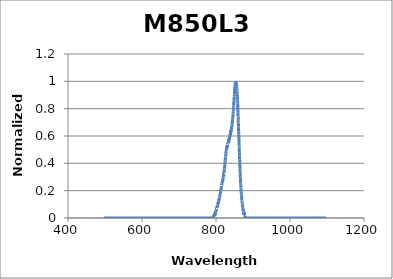
| Category | Normalized Intensity |
|---|---|
| 497.05384596 | 0 |
| 497.20874302 | 0 |
| 497.36364771 | 0 |
| 497.51856002 | 0 |
| 497.67347995 | 0 |
| 497.8284075 | 0 |
| 497.98334267 | 0 |
| 498.13828545 | 0 |
| 498.29323585 | 0 |
| 498.44819386 | 0 |
| 498.60315949 | 0 |
| 498.75813272 | 0 |
| 498.91311355 | 0 |
| 499.06810199 | 0 |
| 499.22309804 | 0 |
| 499.37810169 | 0 |
| 499.53311293 | 0 |
| 499.68813178 | 0 |
| 499.84315822 | 0 |
| 499.99819225 | 0 |
| 500.15323388 | 0 |
| 500.3082831 | 0 |
| 500.4633399 | 0 |
| 500.6184043 | 0 |
| 500.77347627 | 0 |
| 500.92855584 | 0 |
| 501.08364298 | 0 |
| 501.2387377 | 0 |
| 501.39384 | 0 |
| 501.54894988 | 0 |
| 501.70406733 | 0 |
| 501.85919235 | 0 |
| 502.01432494 | 0 |
| 502.1694651 | 0 |
| 502.32461283 | 0 |
| 502.47976813 | 0 |
| 502.63493098 | 0 |
| 502.7901014 | 0 |
| 502.94527938 | 0 |
| 503.10046492 | 0 |
| 503.25565801 | 0 |
| 503.41085865 | 0 |
| 503.56606685 | 0 |
| 503.7212826 | 0 |
| 503.8765059 | 0 |
| 504.03173674 | 0 |
| 504.18697513 | 0 |
| 504.34222106 | 0 |
| 504.49747454 | 0 |
| 504.65273555 | 0 |
| 504.8080041 | 0 |
| 504.96328019 | 0 |
| 505.11856381 | 0 |
| 505.27385496 | 0 |
| 505.42915365 | 0 |
| 505.58445986 | 0 |
| 505.7397736 | 0 |
| 505.89509487 | 0 |
| 506.05042365 | 0 |
| 506.20575996 | 0 |
| 506.36110379 | 0 |
| 506.51645514 | 0 |
| 506.671814 | 0 |
| 506.82718038 | 0 |
| 506.98255426 | 0 |
| 507.13793566 | 0 |
| 507.29332457 | 0 |
| 507.44872099 | 0 |
| 507.60412491 | 0 |
| 507.75953633 | 0 |
| 507.91495525 | 0 |
| 508.07038168 | 0 |
| 508.2258156 | 0 |
| 508.38125702 | 0 |
| 508.53670593 | 0 |
| 508.69216233 | 0 |
| 508.84762623 | 0 |
| 509.00309761 | 0 |
| 509.15857648 | 0 |
| 509.31406283 | 0 |
| 509.46955667 | 0 |
| 509.62505799 | 0 |
| 509.78056679 | 0 |
| 509.93608306 | 0 |
| 510.09160682 | 0 |
| 510.24713804 | 0 |
| 510.40267674 | 0 |
| 510.55822291 | 0 |
| 510.71377655 | 0 |
| 510.86933765 | 0 |
| 511.02490622 | 0 |
| 511.18048225 | 0 |
| 511.33606575 | 0 |
| 511.4916567 | 0 |
| 511.64725511 | 0 |
| 511.80286098 | 0 |
| 511.9584743 | 0 |
| 512.11409507 | 0 |
| 512.2697233 | 0 |
| 512.42535897 | 0 |
| 512.58100209 | 0 |
| 512.73665265 | 0 |
| 512.89231066 | 0 |
| 513.04797611 | 0 |
| 513.20364899 | 0 |
| 513.35932932 | 0 |
| 513.51501708 | 0 |
| 513.67071228 | 0 |
| 513.8264149 | 0 |
| 513.98212496 | 0 |
| 514.13784245 | 0 |
| 514.29356736 | 0 |
| 514.4492997 | 0 |
| 514.60503946 | 0 |
| 514.76078664 | 0 |
| 514.91654125 | 0 |
| 515.07230327 | 0 |
| 515.2280727 | 0 |
| 515.38384955 | 0 |
| 515.53963381 | 0 |
| 515.69542548 | 0 |
| 515.85122456 | 0 |
| 516.00703105 | 0 |
| 516.16284494 | 0 |
| 516.31866624 | 0 |
| 516.47449494 | 0 |
| 516.63033103 | 0 |
| 516.78617453 | 0 |
| 516.94202542 | 0 |
| 517.0978837 | 0 |
| 517.25374938 | 0 |
| 517.40962244 | 0 |
| 517.5655029 | 0 |
| 517.72139074 | 0 |
| 517.87728596 | 0 |
| 518.03318857 | 0 |
| 518.18909856 | 0 |
| 518.34501593 | 0 |
| 518.50094068 | 0 |
| 518.65687281 | 0 |
| 518.8128123 | 0 |
| 518.96875917 | 0 |
| 519.12471341 | 0 |
| 519.28067502 | 0 |
| 519.436644 | 0 |
| 519.59262034 | 0 |
| 519.74860404 | 0 |
| 519.9045951 | 0 |
| 520.06059353 | 0 |
| 520.21659931 | 0 |
| 520.37261245 | 0 |
| 520.52863294 | 0 |
| 520.68466078 | 0 |
| 520.84069597 | 0 |
| 520.99673852 | 0 |
| 521.1527884 | 0 |
| 521.30884564 | 0 |
| 521.46491022 | 0 |
| 521.62098213 | 0 |
| 521.77706139 | 0 |
| 521.93314799 | 0 |
| 522.08924192 | 0 |
| 522.24534318 | 0 |
| 522.40145178 | 0 |
| 522.5575677 | 0 |
| 522.71369096 | 0 |
| 522.86982154 | 0 |
| 523.02595945 | 0 |
| 523.18210468 | 0 |
| 523.33825723 | 0 |
| 523.4944171 | 0 |
| 523.65058429 | 0 |
| 523.80675879 | 0 |
| 523.96294061 | 0 |
| 524.11912974 | 0 |
| 524.27532618 | 0 |
| 524.43152993 | 0 |
| 524.58774098 | 0 |
| 524.74395935 | 0 |
| 524.90018501 | 0 |
| 525.05641797 | 0 |
| 525.21265824 | 0 |
| 525.3689058 | 0 |
| 525.52516065 | 0 |
| 525.68142281 | 0 |
| 525.83769225 | 0 |
| 525.99396898 | 0 |
| 526.150253 | 0 |
| 526.30654431 | 0 |
| 526.46284291 | 0 |
| 526.61914878 | 0 |
| 526.77546194 | 0 |
| 526.93178238 | 0 |
| 527.08811009 | 0 |
| 527.24444508 | 0 |
| 527.40078734 | 0 |
| 527.55713688 | 0 |
| 527.71349369 | 0 |
| 527.86985776 | 0 |
| 528.0262291 | 0 |
| 528.18260771 | 0 |
| 528.33899358 | 0 |
| 528.49538671 | 0 |
| 528.6517871 | 0 |
| 528.80819474 | 0 |
| 528.96460965 | 0 |
| 529.1210318 | 0 |
| 529.27746121 | 0 |
| 529.43389787 | 0 |
| 529.59034178 | 0 |
| 529.74679293 | 0 |
| 529.90325133 | 0 |
| 530.05971697 | 0 |
| 530.21618985 | 0 |
| 530.37266997 | 0 |
| 530.52915733 | 0 |
| 530.68565193 | 0 |
| 530.84215376 | 0 |
| 530.99866282 | 0 |
| 531.15517911 | 0 |
| 531.31170263 | 0 |
| 531.46823338 | 0 |
| 531.62477135 | 0 |
| 531.78131654 | 0 |
| 531.93786896 | 0 |
| 532.09442859 | 0 |
| 532.25099544 | 0 |
| 532.40756951 | 0 |
| 532.56415079 | 0 |
| 532.72073928 | 0 |
| 532.87733499 | 0 |
| 533.0339379 | 0 |
| 533.19054802 | 0 |
| 533.34716534 | 0 |
| 533.50378987 | 0 |
| 533.6604216 | 0 |
| 533.81706052 | 0 |
| 533.97370665 | 0 |
| 534.13035997 | 0 |
| 534.28702048 | 0 |
| 534.44368818 | 0 |
| 534.60036308 | 0 |
| 534.75704516 | 0 |
| 534.91373443 | 0 |
| 535.07043089 | 0 |
| 535.22713453 | 0 |
| 535.38384535 | 0 |
| 535.54056335 | 0 |
| 535.69728852 | 0 |
| 535.85402087 | 0 |
| 536.0107604 | 0 |
| 536.1675071 | 0 |
| 536.32426096 | 0 |
| 536.481022 | 0 |
| 536.6377902 | 0 |
| 536.79456557 | 0 |
| 536.9513481 | 0 |
| 537.10813779 | 0 |
| 537.26493464 | 0 |
| 537.42173865 | 0 |
| 537.57854981 | 0 |
| 537.73536813 | 0 |
| 537.8921936 | 0 |
| 538.04902622 | 0 |
| 538.20586598 | 0 |
| 538.3627129 | 0 |
| 538.51956696 | 0 |
| 538.67642816 | 0 |
| 538.8332965 | 0 |
| 538.99017198 | 0 |
| 539.1470546 | 0 |
| 539.30394436 | 0 |
| 539.46084125 | 0 |
| 539.61774527 | 0 |
| 539.77465642 | 0 |
| 539.9315747 | 0 |
| 540.0885001 | 0 |
| 540.24543263 | 0 |
| 540.40237228 | 0 |
| 540.55931906 | 0 |
| 540.71627295 | 0 |
| 540.87323396 | 0 |
| 541.03020209 | 0 |
| 541.18717733 | 0 |
| 541.34415968 | 0 |
| 541.50114914 | 0 |
| 541.65814571 | 0 |
| 541.81514939 | 0 |
| 541.97216017 | 0 |
| 542.12917805 | 0 |
| 542.28620304 | 0 |
| 542.44323512 | 0 |
| 542.60027431 | 0 |
| 542.75732058 | 0 |
| 542.91437395 | 0 |
| 543.07143442 | 0 |
| 543.22850197 | 0 |
| 543.38557661 | 0 |
| 543.54265834 | 0 |
| 543.69974715 | 0 |
| 543.85684305 | 0 |
| 544.01394602 | 0 |
| 544.17105608 | 0 |
| 544.32817321 | 0 |
| 544.48529742 | 0 |
| 544.6424287 | 0 |
| 544.79956706 | 0 |
| 544.95671248 | 0 |
| 545.11386497 | 0 |
| 545.27102453 | 0 |
| 545.42819116 | 0 |
| 545.58536484 | 0 |
| 545.74254559 | 0 |
| 545.89973339 | 0 |
| 546.05692826 | 0 |
| 546.21413018 | 0 |
| 546.37133915 | 0 |
| 546.52855517 | 0 |
| 546.68577825 | 0 |
| 546.84300837 | 0 |
| 547.00024554 | 0 |
| 547.15748976 | 0 |
| 547.31474101 | 0 |
| 547.47199931 | 0 |
| 547.62926465 | 0 |
| 547.78653702 | 0 |
| 547.94381643 | 0 |
| 548.10110287 | 0 |
| 548.25839635 | 0 |
| 548.41569686 | 0 |
| 548.57300439 | 0 |
| 548.73031895 | 0 |
| 548.88764053 | 0 |
| 549.04496914 | 0 |
| 549.20230477 | 0 |
| 549.35964742 | 0 |
| 549.51699708 | 0 |
| 549.67435376 | 0 |
| 549.83171745 | 0 |
| 549.98908816 | 0 |
| 550.14646588 | 0 |
| 550.3038506 | 0 |
| 550.46124233 | 0 |
| 550.61864106 | 0 |
| 550.7760468 | 0 |
| 550.93345954 | 0 |
| 551.09087928 | 0 |
| 551.24830601 | 0 |
| 551.40573974 | 0 |
| 551.56318047 | 0 |
| 551.72062818 | 0 |
| 551.87808289 | 0 |
| 552.03554458 | 0 |
| 552.19301326 | 0 |
| 552.35048893 | 0 |
| 552.50797158 | 0 |
| 552.6654612 | 0 |
| 552.82295781 | 0 |
| 552.9804614 | 0 |
| 553.13797196 | 0 |
| 553.29548949 | 0 |
| 553.453014 | 0 |
| 553.61054547 | 0 |
| 553.76808392 | 0 |
| 553.92562933 | 0 |
| 554.0831817 | 0 |
| 554.24074104 | 0 |
| 554.39830734 | 0 |
| 554.5558806 | 0 |
| 554.71346081 | 0 |
| 554.87104798 | 0 |
| 555.0286421 | 0 |
| 555.18624318 | 0 |
| 555.3438512 | 0 |
| 555.50146618 | 0 |
| 555.6590881 | 0 |
| 555.81671696 | 0 |
| 555.97435277 | 0 |
| 556.13199552 | 0 |
| 556.28964521 | 0 |
| 556.44730183 | 0 |
| 556.60496539 | 0 |
| 556.76263588 | 0 |
| 556.92031331 | 0 |
| 557.07799766 | 0 |
| 557.23568895 | 0 |
| 557.39338716 | 0 |
| 557.55109229 | 0 |
| 557.70880435 | 0 |
| 557.86652332 | 0 |
| 558.02424922 | 0 |
| 558.18198203 | 0 |
| 558.33972176 | 0 |
| 558.49746841 | 0 |
| 558.65522196 | 0 |
| 558.81298243 | 0 |
| 558.9707498 | 0 |
| 559.12852408 | 0 |
| 559.28630526 | 0 |
| 559.44409335 | 0 |
| 559.60188833 | 0 |
| 559.75969022 | 0 |
| 559.917499 | 0 |
| 560.07531468 | 0 |
| 560.23313725 | 0 |
| 560.39096672 | 0 |
| 560.54880307 | 0 |
| 560.70664631 | 0 |
| 560.86449644 | 0 |
| 561.02235345 | 0 |
| 561.18021735 | 0 |
| 561.33808812 | 0 |
| 561.49596578 | 0 |
| 561.65385031 | 0 |
| 561.81174172 | 0 |
| 561.96964 | 0 |
| 562.12754515 | 0 |
| 562.28545717 | 0 |
| 562.44337606 | 0 |
| 562.60130182 | 0 |
| 562.75923444 | 0 |
| 562.91717393 | 0 |
| 563.07512027 | 0 |
| 563.23307348 | 0 |
| 563.39103354 | 0 |
| 563.54900045 | 0 |
| 563.70697422 | 0 |
| 563.86495484 | 0 |
| 564.02294232 | 0 |
| 564.18093664 | 0 |
| 564.3389378 | 0 |
| 564.49694581 | 0 |
| 564.65496066 | 0 |
| 564.81298236 | 0 |
| 564.97101089 | 0 |
| 565.12904626 | 0 |
| 565.28708846 | 0 |
| 565.4451375 | 0 |
| 565.60319337 | 0 |
| 565.76125607 | 0 |
| 565.9193256 | 0 |
| 566.07740196 | 0 |
| 566.23548513 | 0 |
| 566.39357514 | 0 |
| 566.55167196 | 0 |
| 566.7097756 | 0 |
| 566.86788606 | 0 |
| 567.02600333 | 0 |
| 567.18412742 | 0 |
| 567.34225832 | 0 |
| 567.50039602 | 0 |
| 567.65854054 | 0 |
| 567.81669186 | 0 |
| 567.97484999 | 0 |
| 568.13301492 | 0 |
| 568.29118665 | 0 |
| 568.44936518 | 0 |
| 568.60755051 | 0 |
| 568.76574263 | 0 |
| 568.92394154 | 0 |
| 569.08214725 | 0 |
| 569.24035975 | 0 |
| 569.39857903 | 0 |
| 569.5568051 | 0 |
| 569.71503796 | 0 |
| 569.8732776 | 0 |
| 570.03152401 | 0 |
| 570.18977721 | 0 |
| 570.34803719 | 0 |
| 570.50630394 | 0 |
| 570.66457746 | 0 |
| 570.82285775 | 0 |
| 570.98114482 | 0 |
| 571.13943865 | 0 |
| 571.29773925 | 0 |
| 571.45604661 | 0 |
| 571.61436074 | 0 |
| 571.77268163 | 0 |
| 571.93100927 | 0 |
| 572.08934367 | 0 |
| 572.24768483 | 0 |
| 572.40603274 | 0 |
| 572.56438741 | 0 |
| 572.72274882 | 0 |
| 572.88111698 | 0 |
| 573.03949189 | 0 |
| 573.19787354 | 0 |
| 573.35626193 | 0 |
| 573.51465706 | 0 |
| 573.67305894 | 0 |
| 573.83146755 | 0 |
| 573.98988289 | 0 |
| 574.14830497 | 0 |
| 574.30673378 | 0 |
| 574.46516932 | 0 |
| 574.62361159 | 0 |
| 574.78206058 | 0 |
| 574.9405163 | 0 |
| 575.09897874 | 0 |
| 575.25744791 | 0 |
| 575.41592379 | 0 |
| 575.57440638 | 0 |
| 575.7328957 | 0 |
| 575.89139172 | 0 |
| 576.04989446 | 0 |
| 576.20840391 | 0 |
| 576.36692006 | 0 |
| 576.52544293 | 0 |
| 576.68397249 | 0 |
| 576.84250876 | 0 |
| 577.00105173 | 0 |
| 577.1596014 | 0 |
| 577.31815776 | 0 |
| 577.47672082 | 0 |
| 577.63529058 | 0 |
| 577.79386702 | 0 |
| 577.95245016 | 0 |
| 578.11103998 | 0 |
| 578.26963649 | 0 |
| 578.42823968 | 0 |
| 578.58684956 | 0 |
| 578.74546611 | 0 |
| 578.90408935 | 0 |
| 579.06271926 | 0 |
| 579.22135585 | 0 |
| 579.37999911 | 0 |
| 579.53864904 | 0 |
| 579.69730564 | 0 |
| 579.85596891 | 0 |
| 580.01463885 | 0 |
| 580.17331545 | 0 |
| 580.33199871 | 0 |
| 580.49068864 | 0 |
| 580.64938522 | 0 |
| 580.80808846 | 0 |
| 580.96679835 | 0 |
| 581.1255149 | 0 |
| 581.2842381 | 0 |
| 581.44296795 | 0 |
| 581.60170444 | 0 |
| 581.76044759 | 0 |
| 581.91919737 | 0 |
| 582.0779538 | 0 |
| 582.23671687 | 0 |
| 582.39548658 | 0 |
| 582.55426293 | 0 |
| 582.71304591 | 0 |
| 582.87183552 | 0 |
| 583.03063177 | 0 |
| 583.18943464 | 0 |
| 583.34824415 | 0 |
| 583.50706028 | 0 |
| 583.66588303 | 0 |
| 583.82471241 | 0 |
| 583.9835484 | 0 |
| 584.14239102 | 0 |
| 584.30124025 | 0 |
| 584.4600961 | 0 |
| 584.61895856 | 0 |
| 584.77782763 | 0 |
| 584.93670331 | 0 |
| 585.0955856 | 0 |
| 585.2544745 | 0 |
| 585.41337 | 0 |
| 585.5722721 | 0 |
| 585.7311808 | 0 |
| 585.89009611 | 0 |
| 586.049018 | 0 |
| 586.2079465 | 0 |
| 586.36688159 | 0 |
| 586.52582326 | 0 |
| 586.68477153 | 0 |
| 586.84372639 | 0 |
| 587.00268783 | 0 |
| 587.16165586 | 0 |
| 587.32063047 | 0 |
| 587.47961166 | 0 |
| 587.63859942 | 0 |
| 587.79759377 | 0 |
| 587.95659469 | 0 |
| 588.11560218 | 0 |
| 588.27461625 | 0 |
| 588.43363688 | 0 |
| 588.59266408 | 0 |
| 588.75169785 | 0 |
| 588.91073818 | 0 |
| 589.06978508 | 0 |
| 589.22883853 | 0 |
| 589.38789855 | 0 |
| 589.54696512 | 0 |
| 589.70603824 | 0 |
| 589.86511792 | 0 |
| 590.02420415 | 0 |
| 590.18329693 | 0 |
| 590.34239626 | 0 |
| 590.50150214 | 0 |
| 590.66061455 | 0 |
| 590.81973352 | 0 |
| 590.97885902 | 0 |
| 591.13799106 | 0 |
| 591.29712963 | 0 |
| 591.45627474 | 0 |
| 591.61542639 | 0 |
| 591.77458457 | 0 |
| 591.93374927 | 0 |
| 592.09292051 | 0 |
| 592.25209827 | 0 |
| 592.41128255 | 0 |
| 592.57047336 | 0 |
| 592.72967068 | 0 |
| 592.88887453 | 0 |
| 593.04808489 | 0 |
| 593.20730177 | 0 |
| 593.36652516 | 0 |
| 593.52575506 | 0 |
| 593.68499147 | 0 |
| 593.84423439 | 0 |
| 594.00348382 | 0 |
| 594.16273975 | 0 |
| 594.32200218 | 0 |
| 594.48127111 | 0 |
| 594.64054654 | 0 |
| 594.79982847 | 0 |
| 594.95911689 | 0 |
| 595.11841181 | 0 |
| 595.27771321 | 0 |
| 595.43702111 | 0 |
| 595.59633549 | 0 |
| 595.75565637 | 0 |
| 595.91498372 | 0 |
| 596.07431756 | 0 |
| 596.23365787 | 0 |
| 596.39300467 | 0 |
| 596.55235794 | 0 |
| 596.71171769 | 0 |
| 596.87108391 | 0 |
| 597.0304566 | 0 |
| 597.18983577 | 0 |
| 597.3492214 | 0 |
| 597.50861349 | 0 |
| 597.66801205 | 0 |
| 597.82741707 | 0 |
| 597.98682856 | 0 |
| 598.1462465 | 0 |
| 598.3056709 | 0 |
| 598.46510175 | 0 |
| 598.62453905 | 0 |
| 598.78398281 | 0 |
| 598.94343302 | 0 |
| 599.10288967 | 0 |
| 599.26235277 | 0 |
| 599.42182232 | 0 |
| 599.5812983 | 0 |
| 599.74078073 | 0 |
| 599.9002696 | 0 |
| 600.0597649 | 0 |
| 600.21926664 | 0 |
| 600.37877481 | 0 |
| 600.53828941 | 0 |
| 600.69781044 | 0 |
| 600.8573379 | 0 |
| 601.01687179 | 0 |
| 601.1764121 | 0 |
| 601.33595883 | 0 |
| 601.49551198 | 0 |
| 601.65507155 | 0 |
| 601.81463754 | 0 |
| 601.97420994 | 0 |
| 602.13378876 | 0 |
| 602.29337398 | 0 |
| 602.45296562 | 0 |
| 602.61256366 | 0 |
| 602.77216811 | 0 |
| 602.93177897 | 0 |
| 603.09139622 | 0 |
| 603.25101988 | 0 |
| 603.41064993 | 0 |
| 603.57028639 | 0 |
| 603.72992923 | 0 |
| 603.88957847 | 0 |
| 604.0492341 | 0 |
| 604.20889612 | 0 |
| 604.36856453 | 0 |
| 604.52823933 | 0 |
| 604.6879205 | 0 |
| 604.84760806 | 0 |
| 605.00730201 | 0 |
| 605.16700232 | 0 |
| 605.32670902 | 0 |
| 605.48642209 | 0 |
| 605.64614154 | 0 |
| 605.80586735 | 0 |
| 605.96559954 | 0 |
| 606.12533809 | 0 |
| 606.28508301 | 0 |
| 606.44483429 | 0 |
| 606.60459193 | 0 |
| 606.76435594 | 0 |
| 606.9241263 | 0 |
| 607.08390302 | 0 |
| 607.2436861 | 0 |
| 607.40347552 | 0 |
| 607.5632713 | 0 |
| 607.72307343 | 0 |
| 607.88288191 | 0 |
| 608.04269673 | 0 |
| 608.2025179 | 0 |
| 608.3623454 | 0 |
| 608.52217925 | 0 |
| 608.68201944 | 0 |
| 608.84186596 | 0 |
| 609.00171882 | 0 |
| 609.16157802 | 0 |
| 609.32144354 | 0 |
| 609.48131539 | 0 |
| 609.64119357 | 0 |
| 609.80107808 | 0 |
| 609.96096891 | 0 |
| 610.12086606 | 0 |
| 610.28076953 | 0 |
| 610.44067932 | 0 |
| 610.60059543 | 0 |
| 610.76051785 | 0 |
| 610.92044659 | 0 |
| 611.08038163 | 0 |
| 611.24032299 | 0 |
| 611.40027065 | 0 |
| 611.56022462 | 0 |
| 611.7201849 | 0 |
| 611.88015147 | 0 |
| 612.04012435 | 0 |
| 612.20010352 | 0 |
| 612.36008899 | 0 |
| 612.52008076 | 0 |
| 612.68007882 | 0 |
| 612.84008317 | 0 |
| 613.00009381 | 0 |
| 613.16011074 | 0 |
| 613.32013395 | 0 |
| 613.48016344 | 0 |
| 613.64019922 | 0 |
| 613.80024128 | 0 |
| 613.96028962 | 0 |
| 614.12034423 | 0 |
| 614.28040512 | 0 |
| 614.44047229 | 0 |
| 614.60054572 | 0 |
| 614.76062542 | 0 |
| 614.92071139 | 0 |
| 615.08080363 | 0 |
| 615.24090213 | 0 |
| 615.40100689 | 0 |
| 615.56111791 | 0 |
| 615.72123519 | 0 |
| 615.88135873 | 0 |
| 616.04148852 | 0 |
| 616.20162457 | 0 |
| 616.36176686 | 0 |
| 616.52191541 | 0 |
| 616.6820702 | 0 |
| 616.84223124 | 0 |
| 617.00239853 | 0 |
| 617.16257205 | 0 |
| 617.32275182 | 0 |
| 617.48293782 | 0 |
| 617.64313006 | 0 |
| 617.80332853 | 0 |
| 617.96353324 | 0 |
| 618.12374418 | 0 |
| 618.28396135 | 0 |
| 618.44418475 | 0 |
| 618.60441437 | 0 |
| 618.76465021 | 0 |
| 618.92489228 | 0 |
| 619.08514057 | 0 |
| 619.24539508 | 0 |
| 619.4056558 | 0 |
| 619.56592274 | 0 |
| 619.72619589 | 0 |
| 619.88647525 | 0 |
| 620.04676082 | 0 |
| 620.2070526 | 0 |
| 620.36735058 | 0 |
| 620.52765477 | 0 |
| 620.68796516 | 0 |
| 620.84828175 | 0 |
| 621.00860454 | 0 |
| 621.16893353 | 0 |
| 621.32926871 | 0 |
| 621.48961008 | 0 |
| 621.64995764 | 0 |
| 621.8103114 | 0 |
| 621.97067134 | 0 |
| 622.13103747 | 0 |
| 622.29140978 | 0 |
| 622.45178827 | 0 |
| 622.61217294 | 0 |
| 622.77256379 | 0 |
| 622.93296082 | 0 |
| 623.09336402 | 0 |
| 623.2537734 | 0 |
| 623.41418895 | 0 |
| 623.57461066 | 0 |
| 623.73503854 | 0 |
| 623.89547259 | 0 |
| 624.05591281 | 0 |
| 624.21635918 | 0 |
| 624.37681172 | 0 |
| 624.53727041 | 0 |
| 624.69773526 | 0 |
| 624.85820626 | 0 |
| 625.01868342 | 0 |
| 625.17916673 | 0 |
| 625.33965619 | 0 |
| 625.50015179 | 0 |
| 625.66065354 | 0 |
| 625.82116144 | 0 |
| 625.98167548 | 0 |
| 626.14219565 | 0 |
| 626.30272197 | 0 |
| 626.46325442 | 0 |
| 626.62379301 | 0 |
| 626.78433773 | 0 |
| 626.94488858 | 0 |
| 627.10544556 | 0 |
| 627.26600866 | 0 |
| 627.4265779 | 0 |
| 627.58715325 | 0 |
| 627.74773473 | 0 |
| 627.90832233 | 0 |
| 628.06891605 | 0 |
| 628.22951588 | 0 |
| 628.39012183 | 0 |
| 628.55073389 | 0 |
| 628.71135206 | 0 |
| 628.87197634 | 0 |
| 629.03260673 | 0 |
| 629.19324323 | 0 |
| 629.35388583 | 0 |
| 629.51453453 | 0 |
| 629.67518933 | 0 |
| 629.83585022 | 0 |
| 629.99651722 | 0 |
| 630.15719031 | 0 |
| 630.31786949 | 0 |
| 630.47855477 | 0 |
| 630.63924613 | 0 |
| 630.79994358 | 0 |
| 630.96064711 | 0 |
| 631.12135673 | 0 |
| 631.28207244 | 0 |
| 631.44279422 | 0 |
| 631.60352208 | 0 |
| 631.76425601 | 0 |
| 631.92499603 | 0 |
| 632.08574211 | 0 |
| 632.24649426 | 0 |
| 632.40725249 | 0 |
| 632.56801678 | 0 |
| 632.72878714 | 0 |
| 632.88956356 | 0 |
| 633.05034604 | 0 |
| 633.21113458 | 0 |
| 633.37192918 | 0 |
| 633.53272984 | 0 |
| 633.69353655 | 0 |
| 633.85434932 | 0 |
| 634.01516814 | 0 |
| 634.175993 | 0 |
| 634.33682391 | 0 |
| 634.49766087 | 0 |
| 634.65850387 | 0 |
| 634.81935292 | 0 |
| 634.980208 | 0 |
| 635.14106912 | 0 |
| 635.30193628 | 0 |
| 635.46280948 | 0 |
| 635.6236887 | 0 |
| 635.78457396 | 0 |
| 635.94546524 | 0 |
| 636.10636256 | 0 |
| 636.2672659 | 0 |
| 636.42817526 | 0 |
| 636.58909064 | 0 |
| 636.75001205 | 0 |
| 636.91093947 | 0 |
| 637.07187291 | 0 |
| 637.23281236 | 0 |
| 637.39375783 | 0 |
| 637.55470931 | 0 |
| 637.7156668 | 0 |
| 637.87663029 | 0 |
| 638.03759979 | 0 |
| 638.19857529 | 0 |
| 638.3595568 | 0 |
| 638.5205443 | 0 |
| 638.68153781 | 0 |
| 638.84253731 | 0 |
| 639.0035428 | 0 |
| 639.16455429 | 0 |
| 639.32557177 | 0 |
| 639.48659523 | 0 |
| 639.64762469 | 0 |
| 639.80866013 | 0 |
| 639.96970155 | 0 |
| 640.13074896 | 0 |
| 640.29180234 | 0 |
| 640.45286171 | 0 |
| 640.61392705 | 0 |
| 640.77499836 | 0 |
| 640.93607565 | 0 |
| 641.09715891 | 0 |
| 641.25824814 | 0 |
| 641.41934333 | 0 |
| 641.58044449 | 0 |
| 641.74155162 | 0 |
| 641.9026647 | 0 |
| 642.06378375 | 0 |
| 642.22490875 | 0 |
| 642.38603971 | 0 |
| 642.54717663 | 0 |
| 642.7083195 | 0 |
| 642.86946831 | 0 |
| 643.03062308 | 0 |
| 643.1917838 | 0 |
| 643.35295046 | 0 |
| 643.51412306 | 0 |
| 643.67530161 | 0 |
| 643.83648609 | 0 |
| 643.99767652 | 0 |
| 644.15887288 | 0 |
| 644.32007517 | 0 |
| 644.4812834 | 0 |
| 644.64249756 | 0 |
| 644.80371765 | 0 |
| 644.96494366 | 0 |
| 645.1261756 | 0 |
| 645.28741347 | 0 |
| 645.44865725 | 0 |
| 645.60990696 | 0 |
| 645.77116258 | 0 |
| 645.93242412 | 0 |
| 646.09369158 | 0 |
| 646.25496495 | 0 |
| 646.41624422 | 0 |
| 646.57752941 | 0 |
| 646.73882051 | 0 |
| 646.90011751 | 0 |
| 647.06142041 | 0 |
| 647.22272921 | 0 |
| 647.38404392 | 0 |
| 647.54536452 | 0 |
| 647.70669102 | 0 |
| 647.86802342 | 0 |
| 648.02936171 | 0 |
| 648.19070588 | 0 |
| 648.35205595 | 0 |
| 648.5134119 | 0 |
| 648.67477374 | 0 |
| 648.83614147 | 0 |
| 648.99751507 | 0 |
| 649.15889456 | 0 |
| 649.32027992 | 0 |
| 649.48167116 | 0 |
| 649.64306827 | 0 |
| 649.80447126 | 0 |
| 649.96588012 | 0 |
| 650.12729484 | 0 |
| 650.28871544 | 0 |
| 650.4501419 | 0 |
| 650.61157422 | 0 |
| 650.7730124 | 0 |
| 650.93445645 | 0 |
| 651.09590635 | 0 |
| 651.25736211 | 0 |
| 651.41882372 | 0 |
| 651.58029119 | 0 |
| 651.7417645 | 0 |
| 651.90324367 | 0 |
| 652.06472868 | 0 |
| 652.22621954 | 0 |
| 652.38771624 | 0 |
| 652.54921878 | 0 |
| 652.71072717 | 0 |
| 652.87224139 | 0 |
| 653.03376145 | 0 |
| 653.19528734 | 0 |
| 653.35681906 | 0 |
| 653.51835662 | 0 |
| 653.6799 | 0 |
| 653.84144921 | 0 |
| 654.00300425 | 0 |
| 654.16456511 | 0 |
| 654.32613179 | 0 |
| 654.4877043 | 0 |
| 654.64928262 | 0 |
| 654.81086675 | 0 |
| 654.9724567 | 0 |
| 655.13405247 | 0 |
| 655.29565404 | 0 |
| 655.45726142 | 0 |
| 655.61887461 | 0 |
| 655.78049361 | 0 |
| 655.94211841 | 0 |
| 656.10374901 | 0 |
| 656.26538541 | 0 |
| 656.42702761 | 0 |
| 656.5886756 | 0 |
| 656.75032939 | 0 |
| 656.91198898 | 0 |
| 657.07365435 | 0 |
| 657.23532551 | 0 |
| 657.39700246 | 0 |
| 657.55868519 | 0 |
| 657.72037371 | 0 |
| 657.88206801 | 0 |
| 658.04376809 | 0 |
| 658.20547395 | 0 |
| 658.36718558 | 0 |
| 658.52890299 | 0 |
| 658.69062617 | 0 |
| 658.85235512 | 0 |
| 659.01408984 | 0 |
| 659.17583033 | 0 |
| 659.33757658 | 0 |
| 659.4993286 | 0 |
| 659.66108637 | 0 |
| 659.82284991 | 0 |
| 659.98461921 | 0 |
| 660.14639426 | 0 |
| 660.30817507 | 0 |
| 660.46996162 | 0 |
| 660.63175393 | 0 |
| 660.79355199 | 0 |
| 660.9553558 | 0 |
| 661.11716535 | 0 |
| 661.27898064 | 0 |
| 661.44080168 | 0 |
| 661.60262845 | 0 |
| 661.76446097 | 0 |
| 661.92629922 | 0 |
| 662.0881432 | 0 |
| 662.24999292 | 0 |
| 662.41184837 | 0 |
| 662.57370954 | 0 |
| 662.73557645 | 0 |
| 662.89744907 | 0 |
| 663.05932743 | 0 |
| 663.2212115 | 0 |
| 663.38310129 | 0 |
| 663.5449968 | 0 |
| 663.70689803 | 0 |
| 663.86880497 | 0 |
| 664.03071763 | 0 |
| 664.19263599 | 0 |
| 664.35456007 | 0 |
| 664.51648985 | 0 |
| 664.67842534 | 0 |
| 664.84036653 | 0 |
| 665.00231342 | 0 |
| 665.16426601 | 0 |
| 665.3262243 | 0 |
| 665.48818828 | 0 |
| 665.65015796 | 0 |
| 665.81213334 | 0 |
| 665.9741144 | 0 |
| 666.13610115 | 0 |
| 666.29809359 | 0 |
| 666.46009171 | 0 |
| 666.62209552 | 0 |
| 666.78410501 | 0 |
| 666.94612018 | 0 |
| 667.10814103 | 0 |
| 667.27016755 | 0 |
| 667.43219975 | 0 |
| 667.59423761 | 0 |
| 667.75628116 | 0 |
| 667.91833036 | 0 |
| 668.08038524 | 0 |
| 668.24244578 | 0 |
| 668.40451199 | 0 |
| 668.56658385 | 0 |
| 668.72866138 | 0 |
| 668.89074456 | 0 |
| 669.0528334 | 0 |
| 669.2149279 | 0 |
| 669.37702804 | 0 |
| 669.53913384 | 0 |
| 669.70124529 | 0 |
| 669.86336238 | 0 |
| 670.02548512 | 0 |
| 670.1876135 | 0 |
| 670.34974753 | 0 |
| 670.51188719 | 0 |
| 670.67403249 | 0 |
| 670.83618343 | 0 |
| 670.99834 | 0 |
| 671.1605022 | 0 |
| 671.32267004 | 0 |
| 671.4848435 | 0 |
| 671.64702259 | 0 |
| 671.80920731 | 0 |
| 671.97139765 | 0 |
| 672.13359361 | 0 |
| 672.29579519 | 0 |
| 672.45800239 | 0 |
| 672.6202152 | 0 |
| 672.78243363 | 0 |
| 672.94465767 | 0 |
| 673.10688732 | 0 |
| 673.26912258 | 0 |
| 673.43136345 | 0 |
| 673.59360992 | 0 |
| 673.755862 | 0 |
| 673.91811967 | 0 |
| 674.08038295 | 0 |
| 674.24265183 | 0 |
| 674.4049263 | 0 |
| 674.56720636 | 0 |
| 674.72949202 | 0 |
| 674.89178327 | 0 |
| 675.0540801 | 0 |
| 675.21638253 | 0 |
| 675.37869054 | 0 |
| 675.54100413 | 0 |
| 675.7033233 | 0 |
| 675.86564806 | 0 |
| 676.02797839 | 0 |
| 676.1903143 | 0 |
| 676.35265578 | 0 |
| 676.51500283 | 0 |
| 676.67735546 | 0 |
| 676.83971365 | 0 |
| 677.00207741 | 0 |
| 677.16444674 | 0 |
| 677.32682162 | 0 |
| 677.48920207 | 0 |
| 677.65158808 | 0 |
| 677.81397965 | 0 |
| 677.97637678 | 0 |
| 678.13877945 | 0 |
| 678.30118768 | 0 |
| 678.46360146 | 0 |
| 678.62602079 | 0 |
| 678.78844567 | 0 |
| 678.95087609 | 0 |
| 679.11331206 | 0 |
| 679.27575356 | 0 |
| 679.43820061 | 0 |
| 679.60065319 | 0 |
| 679.76311131 | 0 |
| 679.92557497 | 0 |
| 680.08804415 | 0 |
| 680.25051887 | 0 |
| 680.41299912 | 0 |
| 680.57548489 | 0 |
| 680.73797619 | 0 |
| 680.90047301 | 0 |
| 681.06297535 | 0 |
| 681.22548321 | 0 |
| 681.38799659 | 0 |
| 681.55051549 | 0 |
| 681.7130399 | 0 |
| 681.87556982 | 0 |
| 682.03810525 | 0 |
| 682.2006462 | 0 |
| 682.36319264 | 0 |
| 682.5257446 | 0 |
| 682.68830205 | 0 |
| 682.85086501 | 0 |
| 683.01343347 | 0 |
| 683.17600743 | 0 |
| 683.33858688 | 0 |
| 683.50117182 | 0 |
| 683.66376226 | 0 |
| 683.82635819 | 0 |
| 683.98895961 | 0 |
| 684.15156651 | 0 |
| 684.3141789 | 0 |
| 684.47679677 | 0 |
| 684.63942013 | 0 |
| 684.80204896 | 0 |
| 684.96468327 | 0 |
| 685.12732306 | 0 |
| 685.28996832 | 0 |
| 685.45261905 | 0 |
| 685.61527526 | 0 |
| 685.77793693 | 0 |
| 685.94060407 | 0 |
| 686.10327667 | 0 |
| 686.26595474 | 0 |
| 686.42863827 | 0 |
| 686.59132726 | 0 |
| 686.75402171 | 0 |
| 686.91672161 | 0 |
| 687.07942697 | 0 |
| 687.24213778 | 0 |
| 687.40485403 | 0 |
| 687.56757574 | 0 |
| 687.7303029 | 0 |
| 687.8930355 | 0 |
| 688.05577354 | 0 |
| 688.21851703 | 0 |
| 688.38126595 | 0 |
| 688.54402031 | 0 |
| 688.70678011 | 0 |
| 688.86954534 | 0 |
| 689.032316 | 0 |
| 689.1950921 | 0 |
| 689.35787362 | 0 |
| 689.52066057 | 0 |
| 689.68345295 | 0 |
| 689.84625075 | 0 |
| 690.00905396 | 0 |
| 690.1718626 | 0 |
| 690.33467666 | 0 |
| 690.49749613 | 0 |
| 690.66032102 | 0 |
| 690.82315132 | 0 |
| 690.98598703 | 0 |
| 691.14882815 | 0 |
| 691.31167467 | 0 |
| 691.4745266 | 0 |
| 691.63738393 | 0 |
| 691.80024667 | 0 |
| 691.9631148 | 0 |
| 692.12598833 | 0 |
| 692.28886726 | 0 |
| 692.45175158 | 0 |
| 692.6146413 | 0 |
| 692.7775364 | 0 |
| 692.94043689 | 0 |
| 693.10334277 | 0 |
| 693.26625404 | 0 |
| 693.42917069 | 0 |
| 693.59209271 | 0 |
| 693.75502012 | 0 |
| 693.91795291 | 0 |
| 694.08089107 | 0 |
| 694.24383461 | 0 |
| 694.40678352 | 0 |
| 694.56973779 | 0 |
| 694.73269744 | 0 |
| 694.89566246 | 0 |
| 695.05863284 | 0 |
| 695.22160858 | 0 |
| 695.38458968 | 0 |
| 695.54757614 | 0 |
| 695.71056796 | 0 |
| 695.87356514 | 0 |
| 696.03656767 | 0 |
| 696.19957555 | 0 |
| 696.36258879 | 0 |
| 696.52560737 | 0 |
| 696.6886313 | 0 |
| 696.85166057 | 0 |
| 697.01469519 | 0 |
| 697.17773514 | 0 |
| 697.34078044 | 0 |
| 697.50383108 | 0 |
| 697.66688705 | 0 |
| 697.82994835 | 0 |
| 697.99301499 | 0 |
| 698.15608696 | 0 |
| 698.31916425 | 0 |
| 698.48224687 | 0 |
| 698.64533482 | 0 |
| 698.80842809 | 0 |
| 698.97152668 | 0 |
| 699.1346306 | 0 |
| 699.29773982 | 0 |
| 699.46085437 | 0 |
| 699.62397423 | 0 |
| 699.7870994 | 0 |
| 699.95022988 | 0 |
| 700.11336567 | 0 |
| 700.27650677 | 0 |
| 700.43965317 | 0 |
| 700.60280487 | 0 |
| 700.76596188 | 0 |
| 700.92912418 | 0 |
| 701.09229179 | 0 |
| 701.25546468 | 0 |
| 701.41864288 | 0 |
| 701.58182636 | 0 |
| 701.74501514 | 0 |
| 701.9082092 | 0 |
| 702.07140855 | 0 |
| 702.23461318 | 0 |
| 702.3978231 | 0 |
| 702.5610383 | 0 |
| 702.72425878 | 0 |
| 702.88748454 | 0 |
| 703.05071557 | 0 |
| 703.21395188 | 0 |
| 703.37719345 | 0 |
| 703.5404403 | 0 |
| 703.70369242 | 0 |
| 703.8669498 | 0 |
| 704.03021245 | 0 |
| 704.19348036 | 0 |
| 704.35675354 | 0 |
| 704.52003197 | 0 |
| 704.68331566 | 0 |
| 704.8466046 | 0 |
| 705.0098988 | 0 |
| 705.17319825 | 0 |
| 705.33650296 | 0 |
| 705.49981291 | 0 |
| 705.6631281 | 0 |
| 705.82644855 | 0 |
| 705.98977423 | 0 |
| 706.15310516 | 0 |
| 706.31644132 | 0 |
| 706.47978273 | 0 |
| 706.64312936 | 0 |
| 706.80648124 | 0 |
| 706.96983834 | 0 |
| 707.13320068 | 0 |
| 707.29656824 | 0 |
| 707.45994103 | 0 |
| 707.62331905 | 0 |
| 707.78670228 | 0 |
| 707.95009074 | 0 |
| 708.11348442 | 0 |
| 708.27688332 | 0 |
| 708.44028743 | 0 |
| 708.60369676 | 0 |
| 708.76711129 | 0 |
| 708.93053104 | 0 |
| 709.093956 | 0 |
| 709.25738616 | 0 |
| 709.42082153 | 0 |
| 709.5842621 | 0 |
| 709.74770787 | 0 |
| 709.91115884 | 0 |
| 710.07461501 | 0 |
| 710.23807638 | 0 |
| 710.40154294 | 0 |
| 710.56501469 | 0 |
| 710.72849163 | 0 |
| 710.89197376 | 0 |
| 711.05546107 | 0 |
| 711.21895357 | 0 |
| 711.38245126 | 0 |
| 711.54595412 | 0 |
| 711.70946217 | 0 |
| 711.87297539 | 0 |
| 712.03649379 | 0 |
| 712.20001736 | 0 |
| 712.3635461 | 0 |
| 712.52708001 | 0 |
| 712.6906191 | 0 |
| 712.85416335 | 0 |
| 713.01771276 | 0 |
| 713.18126733 | 0 |
| 713.34482707 | 0 |
| 713.50839197 | 0 |
| 713.67196202 | 0 |
| 713.83553723 | 0 |
| 713.9991176 | 0 |
| 714.16270311 | 0 |
| 714.32629378 | 0 |
| 714.48988959 | 0 |
| 714.65349055 | 0 |
| 714.81709666 | 0 |
| 714.98070791 | 0 |
| 715.1443243 | 0 |
| 715.30794583 | 0 |
| 715.47157249 | 0 |
| 715.6352043 | 0 |
| 715.79884123 | 0 |
| 715.9624833 | 0 |
| 716.1261305 | 0 |
| 716.28978282 | 0 |
| 716.45344028 | 0 |
| 716.61710286 | 0 |
| 716.78077056 | 0 |
| 716.94444338 | 0 |
| 717.10812132 | 0 |
| 717.27180438 | 0 |
| 717.43549255 | 0 |
| 717.59918584 | 0 |
| 717.76288424 | 0 |
| 717.92658775 | 0 |
| 718.09029637 | 0 |
| 718.25401009 | 0 |
| 718.41772892 | 0 |
| 718.58145286 | 0 |
| 718.74518189 | 0 |
| 718.90891602 | 0 |
| 719.07265525 | 0 |
| 719.23639958 | 0 |
| 719.400149 | 0 |
| 719.56390351 | 0 |
| 719.72766311 | 0 |
| 719.8914278 | 0 |
| 720.05519758 | 0 |
| 720.21897244 | 0 |
| 720.38275239 | 0 |
| 720.54653741 | 0 |
| 720.71032752 | 0 |
| 720.8741227 | 0 |
| 721.03792296 | 0 |
| 721.20172829 | 0 |
| 721.36553869 | 0 |
| 721.52935417 | 0 |
| 721.69317471 | 0 |
| 721.85700032 | 0 |
| 722.02083099 | 0 |
| 722.18466673 | 0 |
| 722.34850752 | 0 |
| 722.51235338 | 0 |
| 722.67620429 | 0 |
| 722.84006026 | 0 |
| 723.00392129 | 0 |
| 723.16778736 | 0 |
| 723.33165849 | 0 |
| 723.49553466 | 0 |
| 723.65941588 | 0 |
| 723.82330215 | 0 |
| 723.98719345 | 0 |
| 724.1510898 | 0 |
| 724.31499119 | 0 |
| 724.47889761 | 0 |
| 724.64280907 | 0 |
| 724.80672557 | 0 |
| 724.9706471 | 0 |
| 725.13457365 | 0 |
| 725.29850524 | 0 |
| 725.46244185 | 0 |
| 725.62638348 | 0 |
| 725.79033014 | 0 |
| 725.95428182 | 0 |
| 726.11823852 | 0 |
| 726.28220024 | 0 |
| 726.44616697 | 0 |
| 726.61013871 | 0 |
| 726.77411547 | 0 |
| 726.93809724 | 0 |
| 727.10208402 | 0 |
| 727.2660758 | 0 |
| 727.43007258 | 0 |
| 727.59407437 | 0 |
| 727.75808116 | 0 |
| 727.92209295 | 0 |
| 728.08610974 | 0 |
| 728.25013152 | 0 |
| 728.4141583 | 0 |
| 728.57819007 | 0 |
| 728.74222683 | 0 |
| 728.90626857 | 0 |
| 729.07031531 | 0 |
| 729.23436703 | 0 |
| 729.39842373 | 0 |
| 729.56248541 | 0 |
| 729.72655207 | 0 |
| 729.89062371 | 0 |
| 730.05470032 | 0 |
| 730.21878191 | 0 |
| 730.38286847 | 0 |
| 730.54695999 | 0 |
| 730.71105649 | 0 |
| 730.87515796 | 0 |
| 731.03926438 | 0 |
| 731.20337577 | 0 |
| 731.36749213 | 0 |
| 731.53161344 | 0 |
| 731.69573971 | 0 |
| 731.85987093 | 0 |
| 732.02400711 | 0 |
| 732.18814824 | 0 |
| 732.35229432 | 0 |
| 732.51644535 | 0 |
| 732.68060132 | 0 |
| 732.84476224 | 0 |
| 733.0089281 | 0 |
| 733.1730989 | 0 |
| 733.33727464 | 0 |
| 733.50145532 | 0 |
| 733.66564094 | 0 |
| 733.82983148 | 0 |
| 733.99402696 | 0 |
| 734.15822737 | 0 |
| 734.32243271 | 0 |
| 734.48664298 | 0 |
| 734.65085817 | 0 |
| 734.81507828 | 0 |
| 734.97930331 | 0 |
| 735.14353326 | 0 |
| 735.30776813 | 0 |
| 735.47200792 | 0 |
| 735.63625261 | 0 |
| 735.80050222 | 0 |
| 735.96475674 | 0 |
| 736.12901617 | 0 |
| 736.29328051 | 0 |
| 736.45754975 | 0 |
| 736.62182389 | 0 |
| 736.78610293 | 0 |
| 736.95038687 | 0 |
| 737.11467571 | 0 |
| 737.27896945 | 0 |
| 737.44326807 | 0 |
| 737.60757159 | 0 |
| 737.77188 | 0 |
| 737.9361933 | 0 |
| 738.10051149 | 0 |
| 738.26483455 | 0 |
| 738.42916251 | 0 |
| 738.59349534 | 0 |
| 738.75783305 | 0 |
| 738.92217564 | 0 |
| 739.0865231 | 0 |
| 739.25087544 | 0 |
| 739.41523265 | 0 |
| 739.57959473 | 0 |
| 739.74396168 | 0 |
| 739.90833349 | 0 |
| 740.07271017 | 0 |
| 740.23709171 | 0 |
| 740.40147811 | 0 |
| 740.56586938 | 0 |
| 740.73026549 | 0 |
| 740.89466647 | 0 |
| 741.0590723 | 0 |
| 741.22348297 | 0 |
| 741.3878985 | 0 |
| 741.55231888 | 0 |
| 741.7167441 | 0 |
| 741.88117417 | 0 |
| 742.04560908 | 0 |
| 742.21004884 | 0 |
| 742.37449343 | 0 |
| 742.53894285 | 0 |
| 742.70339712 | 0 |
| 742.86785621 | 0 |
| 743.03232014 | 0 |
| 743.1967889 | 0 |
| 743.36126249 | 0 |
| 743.5257409 | 0 |
| 743.69022414 | 0 |
| 743.8547122 | 0 |
| 744.01920508 | 0 |
| 744.18370278 | 0 |
| 744.3482053 | 0 |
| 744.51271263 | 0 |
| 744.67722477 | 0 |
| 744.84174173 | 0 |
| 745.0062635 | 0 |
| 745.17079007 | 0 |
| 745.33532146 | 0 |
| 745.49985764 | 0 |
| 745.66439863 | 0 |
| 745.82894442 | 0 |
| 745.99349501 | 0 |
| 746.1580504 | 0 |
| 746.32261058 | 0 |
| 746.48717555 | 0 |
| 746.65174532 | 0 |
| 746.81631988 | 0 |
| 746.98089922 | 0 |
| 747.14548335 | 0 |
| 747.31007227 | 0 |
| 747.47466597 | 0 |
| 747.63926444 | 0 |
| 747.8038677 | 0 |
| 747.96847574 | 0 |
| 748.13308855 | 0 |
| 748.29770613 | 0 |
| 748.46232849 | 0 |
| 748.62695561 | 0 |
| 748.7915875 | 0 |
| 748.95622416 | 0 |
| 749.12086559 | 0 |
| 749.28551177 | 0 |
| 749.45016272 | 0 |
| 749.61481843 | 0 |
| 749.77947889 | 0 |
| 749.94414411 | 0 |
| 750.10881408 | 0 |
| 750.27348881 | 0 |
| 750.43816828 | 0 |
| 750.6028525 | 0 |
| 750.76754147 | 0 |
| 750.93223518 | 0 |
| 751.09693364 | 0 |
| 751.26163683 | 0 |
| 751.42634477 | 0 |
| 751.59105744 | 0 |
| 751.75577485 | 0 |
| 751.92049699 | 0 |
| 752.08522386 | 0 |
| 752.24995546 | 0 |
| 752.41469179 | 0 |
| 752.57943285 | 0 |
| 752.74417863 | 0 |
| 752.90892914 | 0 |
| 753.07368436 | 0 |
| 753.2384443 | 0 |
| 753.40320896 | 0 |
| 753.56797834 | 0 |
| 753.73275243 | 0 |
| 753.89753123 | 0 |
| 754.06231474 | 0 |
| 754.22710296 | 0 |
| 754.39189588 | 0 |
| 754.55669351 | 0 |
| 754.72149584 | 0 |
| 754.88630287 | 0 |
| 755.05111461 | 0 |
| 755.21593103 | 0 |
| 755.38075216 | 0 |
| 755.54557797 | 0 |
| 755.71040848 | 0 |
| 755.87524368 | 0 |
| 756.04008357 | 0 |
| 756.20492814 | 0 |
| 756.3697774 | 0 |
| 756.53463134 | 0 |
| 756.69948996 | 0 |
| 756.86435326 | 0 |
| 757.02922123 | 0 |
| 757.19409388 | 0 |
| 757.35897121 | 0 |
| 757.5238532 | 0 |
| 757.68873987 | 0 |
| 757.8536312 | 0 |
| 758.01852721 | 0 |
| 758.18342787 | 0 |
| 758.3483332 | 0 |
| 758.51324318 | 0 |
| 758.67815783 | 0 |
| 758.84307714 | 0 |
| 759.00800109 | 0 |
| 759.17292971 | 0 |
| 759.33786297 | 0 |
| 759.50280088 | 0 |
| 759.66774345 | 0 |
| 759.83269065 | 0 |
| 759.99764251 | 0 |
| 760.162599 | 0 |
| 760.32756014 | 0 |
| 760.49252591 | 0 |
| 760.65749632 | 0 |
| 760.82247137 | 0 |
| 760.98745105 | 0 |
| 761.15243536 | 0 |
| 761.3174243 | 0 |
| 761.48241787 | 0 |
| 761.64741607 | 0 |
| 761.81241889 | 0 |
| 761.97742633 | 0 |
| 762.14243839 | 0 |
| 762.30745507 | 0 |
| 762.47247637 | 0 |
| 762.63750228 | 0 |
| 762.80253281 | 0 |
| 762.96756795 | 0 |
| 763.1326077 | 0 |
| 763.29765205 | 0 |
| 763.46270102 | 0 |
| 763.62775458 | 0 |
| 763.79281275 | 0 |
| 763.95787552 | 0 |
| 764.12294289 | 0 |
| 764.28801486 | 0 |
| 764.45309142 | 0 |
| 764.61817257 | 0 |
| 764.78325832 | 0 |
| 764.94834865 | 0 |
| 765.11344358 | 0 |
| 765.27854309 | 0 |
| 765.44364718 | 0 |
| 765.60875586 | 0 |
| 765.77386911 | 0 |
| 765.93898695 | 0 |
| 766.10410936 | 0 |
| 766.26923635 | 0 |
| 766.43436791 | 0 |
| 766.59950404 | 0 |
| 766.76464474 | 0 |
| 766.92979001 | 0 |
| 767.09493985 | 0 |
| 767.26009425 | 0 |
| 767.42525321 | 0 |
| 767.59041674 | 0 |
| 767.75558482 | 0 |
| 767.92075746 | 0 |
| 768.08593465 | 0 |
| 768.2511164 | 0 |
| 768.4163027 | 0 |
| 768.58149355 | 0 |
| 768.74668895 | 0 |
| 768.91188889 | 0 |
| 769.07709338 | 0 |
| 769.2423024 | 0 |
| 769.40751597 | 0 |
| 769.57273408 | 0 |
| 769.73795673 | 0 |
| 769.90318391 | 0 |
| 770.06841562 | 0 |
| 770.23365187 | 0 |
| 770.39889265 | 0 |
| 770.56413795 | 0 |
| 770.72938778 | 0 |
| 770.89464213 | 0 |
| 771.05990101 | 0 |
| 771.2251644 | 0 |
| 771.39043232 | 0 |
| 771.55570475 | 0 |
| 771.7209817 | 0 |
| 771.88626316 | 0 |
| 772.05154913 | 0 |
| 772.21683961 | 0 |
| 772.3821346 | 0 |
| 772.5474341 | 0 |
| 772.7127381 | 0 |
| 772.8780466 | 0 |
| 773.0433596 | 0 |
| 773.2086771 | 0 |
| 773.3739991 | 0 |
| 773.53932559 | 0 |
| 773.70465658 | 0 |
| 773.86999206 | 0 |
| 774.03533203 | 0 |
| 774.20067648 | 0 |
| 774.36602542 | 0 |
| 774.53137885 | 0 |
| 774.69673676 | 0 |
| 774.86209915 | 0 |
| 775.02746601 | 0 |
| 775.19283736 | 0 |
| 775.35821318 | 0 |
| 775.52359347 | 0 |
| 775.68897823 | 0 |
| 775.85436747 | 0 |
| 776.01976117 | 0 |
| 776.18515933 | 0 |
| 776.35056197 | 0 |
| 776.51596906 | 0 |
| 776.68138061 | 0 |
| 776.84679663 | 0 |
| 777.0122171 | 0 |
| 777.17764202 | 0 |
| 777.3430714 | 0 |
| 777.50850523 | 0 |
| 777.67394351 | 0 |
| 777.83938624 | 0 |
| 778.00483341 | 0 |
| 778.17028503 | 0 |
| 778.33574108 | 0 |
| 778.50120158 | 0 |
| 778.66666652 | 0 |
| 778.8321359 | 0 |
| 778.99760971 | 0 |
| 779.16308795 | 0 |
| 779.32857063 | 0 |
| 779.49405773 | 0 |
| 779.65954926 | 0 |
| 779.82504522 | 0 |
| 779.99054561 | 0 |
| 780.15605041 | 0 |
| 780.32155964 | 0 |
| 780.48707328 | 0 |
| 780.65259134 | 0 |
| 780.81811382 | 0 |
| 780.9836407 | 0 |
| 781.14917201 | 0 |
| 781.31470772 | 0 |
| 781.48024783 | 0 |
| 781.64579236 | 0 |
| 781.81134128 | 0 |
| 781.97689461 | 0 |
| 782.14245234 | 0 |
| 782.30801447 | 0 |
| 782.473581 | 0 |
| 782.63915192 | 0 |
| 782.80472723 | 0 |
| 782.97030694 | 0 |
| 783.13589104 | 0 |
| 783.30147952 | 0 |
| 783.46707239 | 0 |
| 783.63266964 | 0 |
| 783.79827127 | 0 |
| 783.96387729 | 0 |
| 784.12948768 | 0 |
| 784.29510245 | 0 |
| 784.4607216 | 0 |
| 784.62634512 | 0 |
| 784.79197301 | 0 |
| 784.95760527 | 0 |
| 785.1232419 | 0 |
| 785.28888289 | 0 |
| 785.45452825 | 0 |
| 785.62017797 | 0 |
| 785.78583205 | 0 |
| 785.95149049 | 0 |
| 786.11715328 | 0 |
| 786.28282043 | 0 |
| 786.44849194 | 0 |
| 786.61416779 | 0 |
| 786.779848 | 0 |
| 786.94553255 | 0 |
| 787.11122145 | 0 |
| 787.27691469 | 0 |
| 787.44261228 | 0 |
| 787.6083142 | 0 |
| 787.77402046 | 0 |
| 787.93973106 | 0 |
| 788.105446 | 0 |
| 788.27116527 | 0 |
| 788.43688887 | 0 |
| 788.6026168 | 0 |
| 788.76834905 | 0 |
| 788.93408564 | 0 |
| 789.09982654 | 0 |
| 789.26557177 | 0 |
| 789.43132132 | 0 |
| 789.59707519 | 0 |
| 789.76283337 | 0 |
| 789.92859587 | 0 |
| 790.09436269 | 0 |
| 790.26013381 | 0 |
| 790.42590924 | 0 |
| 790.59168898 | 0 |
| 790.75747303 | 0 |
| 790.92326138 | 0 |
| 791.08905403 | 0.002 |
| 791.25485099 | 0 |
| 791.42065224 | 0.005 |
| 791.58645779 | 0.001 |
| 791.75226763 | 0.006 |
| 791.91808177 | 0.005 |
| 792.0839002 | 0.01 |
| 792.24972292 | 0.005 |
| 792.41554992 | 0.007 |
| 792.58138121 | 0.008 |
| 792.74721679 | 0.011 |
| 792.91305664 | 0.009 |
| 793.07890078 | 0.011 |
| 793.2447492 | 0.013 |
| 793.41060189 | 0.012 |
| 793.57645886 | 0.013 |
| 793.7423201 | 0.016 |
| 793.90818561 | 0.012 |
| 794.07405539 | 0.018 |
| 794.23992944 | 0.017 |
| 794.40580776 | 0.02 |
| 794.57169034 | 0.017 |
| 794.73757718 | 0.022 |
| 794.90346828 | 0.023 |
| 795.06936364 | 0.023 |
| 795.23526326 | 0.025 |
| 795.40116713 | 0.022 |
| 795.56707525 | 0.026 |
| 795.73298763 | 0.026 |
| 795.89890425 | 0.026 |
| 796.06482513 | 0.023 |
| 796.23075024 | 0.027 |
| 796.39667961 | 0.028 |
| 796.56261321 | 0.023 |
| 796.72855106 | 0.03 |
| 796.89449314 | 0.026 |
| 797.06043946 | 0.03 |
| 797.22639002 | 0.025 |
| 797.3923448 | 0.026 |
| 797.55830382 | 0.023 |
| 797.72426707 | 0.025 |
| 797.89023455 | 0.027 |
| 798.05620625 | 0.04 |
| 798.22218218 | 0.03 |
| 798.38816232 | 0.039 |
| 798.55414669 | 0.033 |
| 798.72013528 | 0.034 |
| 798.88612808 | 0.034 |
| 799.0521251 | 0.046 |
| 799.21812633 | 0.047 |
| 799.38413178 | 0.054 |
| 799.55014143 | 0.054 |
| 799.71615529 | 0.051 |
| 799.88217335 | 0.051 |
| 800.04819562 | 0.052 |
| 800.2142221 | 0.049 |
| 800.38025277 | 0.056 |
| 800.54628764 | 0.05 |
| 800.7123267 | 0.055 |
| 800.87836997 | 0.056 |
| 801.04441742 | 0.061 |
| 801.21046907 | 0.06 |
| 801.3765249 | 0.063 |
| 801.54258492 | 0.068 |
| 801.70864913 | 0.071 |
| 801.87471753 | 0.071 |
| 802.0407901 | 0.073 |
| 802.20686686 | 0.074 |
| 802.37294779 | 0.075 |
| 802.5390329 | 0.075 |
| 802.70512218 | 0.081 |
| 802.87121564 | 0.079 |
| 803.03731327 | 0.082 |
| 803.20341507 | 0.083 |
| 803.36952103 | 0.087 |
| 803.53563117 | 0.083 |
| 803.70174546 | 0.091 |
| 803.86786392 | 0.088 |
| 804.03398654 | 0.093 |
| 804.20011331 | 0.094 |
| 804.36624425 | 0.095 |
| 804.53237933 | 0.096 |
| 804.69851857 | 0.101 |
| 804.86466197 | 0.1 |
| 805.03080951 | 0.102 |
| 805.1969612 | 0.102 |
| 805.36311703 | 0.108 |
| 805.52927701 | 0.106 |
| 805.69544113 | 0.111 |
| 805.86160939 | 0.105 |
| 806.02778179 | 0.113 |
| 806.19395832 | 0.11 |
| 806.36013899 | 0.115 |
| 806.5263238 | 0.115 |
| 806.69251273 | 0.118 |
| 806.85870579 | 0.12 |
| 807.02490299 | 0.123 |
| 807.1911043 | 0.121 |
| 807.35730974 | 0.125 |
| 807.52351931 | 0.123 |
| 807.68973299 | 0.13 |
| 807.85595079 | 0.132 |
| 808.02217271 | 0.135 |
| 808.18839874 | 0.131 |
| 808.35462889 | 0.138 |
| 808.52086314 | 0.137 |
| 808.68710151 | 0.141 |
| 808.85334398 | 0.141 |
| 809.01959056 | 0.144 |
| 809.18584124 | 0.141 |
| 809.35209603 | 0.15 |
| 809.51835491 | 0.151 |
| 809.6846179 | 0.155 |
| 809.85088498 | 0.152 |
| 810.01715615 | 0.157 |
| 810.18343142 | 0.161 |
| 810.34971078 | 0.163 |
| 810.51599423 | 0.164 |
| 810.68228176 | 0.17 |
| 810.84857339 | 0.165 |
| 811.01486909 | 0.171 |
| 811.18116888 | 0.175 |
| 811.34747275 | 0.176 |
| 811.51378069 | 0.175 |
| 811.68009271 | 0.18 |
| 811.84640881 | 0.183 |
| 812.01272898 | 0.191 |
| 812.17905322 | 0.189 |
| 812.34538153 | 0.193 |
| 812.51171391 | 0.196 |
| 812.67805035 | 0.198 |
| 812.84439086 | 0.196 |
| 813.01073543 | 0.203 |
| 813.17708406 | 0.202 |
| 813.34343675 | 0.209 |
| 813.50979349 | 0.208 |
| 813.67615429 | 0.213 |
| 813.84251914 | 0.217 |
| 814.00888804 | 0.222 |
| 814.175261 | 0.223 |
| 814.34163799 | 0.227 |
| 814.50801904 | 0.228 |
| 814.67440413 | 0.233 |
| 814.84079326 | 0.232 |
| 815.00718643 | 0.231 |
| 815.17358364 | 0.234 |
| 815.33998489 | 0.238 |
| 815.50639017 | 0.242 |
| 815.67279948 | 0.25 |
| 815.83921282 | 0.247 |
| 816.0056302 | 0.253 |
| 816.1720516 | 0.253 |
| 816.33847703 | 0.254 |
| 816.50490648 | 0.253 |
| 816.67133995 | 0.257 |
| 816.83777744 | 0.257 |
| 817.00421895 | 0.265 |
| 817.17066448 | 0.263 |
| 817.33711402 | 0.262 |
| 817.50356758 | 0.27 |
| 817.67002514 | 0.275 |
| 817.83648672 | 0.273 |
| 818.0029523 | 0.274 |
| 818.16942189 | 0.278 |
| 818.33589548 | 0.28 |
| 818.50237307 | 0.283 |
| 818.66885467 | 0.287 |
| 818.83534026 | 0.281 |
| 819.00182985 | 0.289 |
| 819.16832343 | 0.291 |
| 819.33482101 | 0.294 |
| 819.50132257 | 0.294 |
| 819.66782813 | 0.297 |
| 819.83433767 | 0.299 |
| 820.0008512 | 0.306 |
| 820.16736872 | 0.306 |
| 820.33389021 | 0.314 |
| 820.50041569 | 0.305 |
| 820.66694514 | 0.318 |
| 820.83347857 | 0.312 |
| 821.00001597 | 0.319 |
| 821.16655735 | 0.323 |
| 821.3331027 | 0.327 |
| 821.49965202 | 0.327 |
| 821.6662053 | 0.334 |
| 821.83276255 | 0.337 |
| 821.99932377 | 0.344 |
| 822.16588894 | 0.339 |
| 822.33245808 | 0.349 |
| 822.49903117 | 0.359 |
| 822.66560822 | 0.363 |
| 822.83218923 | 0.367 |
| 822.99877419 | 0.372 |
| 823.16536309 | 0.372 |
| 823.33195595 | 0.375 |
| 823.49855276 | 0.38 |
| 823.66515351 | 0.386 |
| 823.8317582 | 0.393 |
| 823.99836684 | 0.395 |
| 824.16497942 | 0.399 |
| 824.33159593 | 0.405 |
| 824.49821638 | 0.412 |
| 824.66484077 | 0.412 |
| 824.83146909 | 0.418 |
| 824.99810134 | 0.423 |
| 825.16473752 | 0.434 |
| 825.33137762 | 0.429 |
| 825.49802166 | 0.44 |
| 825.66466961 | 0.441 |
| 825.83132149 | 0.449 |
| 825.99797729 | 0.45 |
| 826.164637 | 0.455 |
| 826.33130063 | 0.462 |
| 826.49796818 | 0.465 |
| 826.66463964 | 0.468 |
| 826.83131501 | 0.472 |
| 826.99799429 | 0.485 |
| 827.16467747 | 0.479 |
| 827.33136457 | 0.483 |
| 827.49805556 | 0.487 |
| 827.66475046 | 0.487 |
| 827.83144926 | 0.493 |
| 827.99815195 | 0.498 |
| 828.16485855 | 0.502 |
| 828.33156903 | 0.5 |
| 828.49828341 | 0.505 |
| 828.66500168 | 0.508 |
| 828.83172384 | 0.516 |
| 828.99844989 | 0.51 |
| 829.16517982 | 0.518 |
| 829.33191364 | 0.523 |
| 829.49865134 | 0.525 |
| 829.66539291 | 0.518 |
| 829.83213837 | 0.527 |
| 829.9988877 | 0.521 |
| 830.16564091 | 0.53 |
| 830.33239799 | 0.526 |
| 830.49915894 | 0.524 |
| 830.66592376 | 0.532 |
| 830.83269245 | 0.531 |
| 830.999465 | 0.53 |
| 831.16624141 | 0.532 |
| 831.33302169 | 0.53 |
| 831.49980583 | 0.534 |
| 831.66659383 | 0.536 |
| 831.83338568 | 0.538 |
| 832.00018139 | 0.538 |
| 832.16698094 | 0.539 |
| 832.33378436 | 0.543 |
| 832.50059161 | 0.546 |
| 832.66740272 | 0.546 |
| 832.83421767 | 0.555 |
| 833.00103647 | 0.553 |
| 833.16785911 | 0.552 |
| 833.33468559 | 0.548 |
| 833.5015159 | 0.553 |
| 833.66835005 | 0.555 |
| 833.83518804 | 0.558 |
| 834.00202986 | 0.557 |
| 834.16887551 | 0.565 |
| 834.33572499 | 0.555 |
| 834.50257829 | 0.569 |
| 834.66943543 | 0.567 |
| 834.83629638 | 0.57 |
| 835.00316116 | 0.573 |
| 835.17002976 | 0.572 |
| 835.33690217 | 0.568 |
| 835.5037784 | 0.581 |
| 835.67065845 | 0.574 |
| 835.83754231 | 0.577 |
| 836.00442998 | 0.576 |
| 836.17132146 | 0.586 |
| 836.33821674 | 0.583 |
| 836.50511583 | 0.591 |
| 836.67201873 | 0.585 |
| 836.83892543 | 0.588 |
| 837.00583592 | 0.593 |
| 837.17275022 | 0.595 |
| 837.33966831 | 0.596 |
| 837.50659019 | 0.599 |
| 837.67351587 | 0.598 |
| 837.84044534 | 0.604 |
| 838.0073786 | 0.603 |
| 838.17431564 | 0.609 |
| 838.34125648 | 0.606 |
| 838.5082010900001 | 0.614 |
| 838.67514949 | 0.608 |
| 838.84210166 | 0.615 |
| 839.00905762 | 0.614 |
| 839.17601735 | 0.627 |
| 839.34298085 | 0.622 |
| 839.50994813 | 0.627 |
| 839.67691918 | 0.624 |
| 839.84389399 | 0.629 |
| 840.01087258 | 0.632 |
| 840.17785493 | 0.635 |
| 840.34484104 | 0.631 |
| 840.51183092 | 0.64 |
| 840.67882455 | 0.635 |
| 840.84582194 | 0.647 |
| 841.01282309 | 0.645 |
| 841.179828 | 0.645 |
| 841.34683665 | 0.65 |
| 841.51384906 | 0.657 |
| 841.68086522 | 0.658 |
| 841.84788512 | 0.653 |
| 842.01490877 | 0.665 |
| 842.18193616 | 0.664 |
| 842.34896729 | 0.665 |
| 842.51600217 | 0.673 |
| 842.68304078 | 0.67 |
| 842.85008313 | 0.668 |
| 843.01712921 | 0.674 |
| 843.18417902 | 0.682 |
| 843.35123257 | 0.682 |
| 843.51828985 | 0.688 |
| 843.68535085 | 0.693 |
| 843.85241557 | 0.699 |
| 844.01948403 | 0.703 |
| 844.1865562 | 0.712 |
| 844.35363209 | 0.704 |
| 844.5207117 | 0.715 |
| 844.68779503 | 0.715 |
| 844.85488207 | 0.723 |
| 845.02197282 | 0.722 |
| 845.18906729 | 0.727 |
| 845.35616546 | 0.731 |
| 845.52326734 | 0.736 |
| 845.69037293 | 0.743 |
| 845.85748221 | 0.75 |
| 846.02459521 | 0.754 |
| 846.1917119 | 0.765 |
| 846.35883229 | 0.766 |
| 846.52595637 | 0.779 |
| 846.69308415 | 0.782 |
| 846.86021562 | 0.787 |
| 847.02735078 | 0.792 |
| 847.19448964 | 0.802 |
| 847.36163217 | 0.807 |
| 847.5287784 | 0.817 |
| 847.69592831 | 0.821 |
| 847.8630819 | 0.828 |
| 848.03023916 | 0.837 |
| 848.19740011 | 0.849 |
| 848.36456474 | 0.848 |
| 848.53173303 | 0.859 |
| 848.698905 | 0.86 |
| 848.86608064 | 0.871 |
| 849.03325995 | 0.88 |
| 849.20044293 | 0.885 |
| 849.36762957 | 0.889 |
| 849.53481988 | 0.902 |
| 849.70201385 | 0.904 |
| 849.86921147 | 0.914 |
| 850.03641276 | 0.921 |
| 850.2036177 | 0.927 |
| 850.37082629 | 0.936 |
| 850.53803854 | 0.94 |
| 850.70525444 | 0.945 |
| 850.87247399 | 0.952 |
| 851.03969718 | 0.956 |
| 851.20692402 | 0.959 |
| 851.37415451 | 0.962 |
| 851.54138863 | 0.969 |
| 851.7086264 | 0.968 |
| 851.8758678 | 0.982 |
| 852.04311284 | 0.976 |
| 852.21036151 | 0.984 |
| 852.37761382 | 0.989 |
| 852.54486976 | 0.989 |
| 852.71212932 | 0.993 |
| 852.87939251 | 0.994 |
| 853.04665933 | 0.987 |
| 853.21392977 | 1 |
| 853.38120384 | 0.987 |
| 853.54848152 | 0.996 |
| 853.71576282 | 0.997 |
| 853.88304774 | 0.999 |
| 854.05033627 | 0.994 |
| 854.21762841 | 0.999 |
| 854.38492417 | 0.995 |
| 854.55222353 | 0.99 |
| 854.7195265 | 0.989 |
| 854.88683307 | 0.99 |
| 855.05414325 | 0.984 |
| 855.22145703 | 0.982 |
| 855.38877441 | 0.974 |
| 855.55609539 | 0.975 |
| 855.72341997 | 0.971 |
| 855.89074813 | 0.974 |
| 856.0580799 | 0.962 |
| 856.22541525 | 0.952 |
| 856.39275419 | 0.948 |
| 856.56009671 | 0.944 |
| 856.72744283 | 0.932 |
| 856.89479252 | 0.932 |
| 857.0621458 | 0.927 |
| 857.22950266 | 0.913 |
| 857.39686309 | 0.901 |
| 857.56422711 | 0.902 |
| 857.73159469 | 0.887 |
| 857.89896585 | 0.875 |
| 858.06634058 | 0.867 |
| 858.23371888 | 0.853 |
| 858.40110074 | 0.849 |
| 858.56848617 | 0.838 |
| 858.73587516 | 0.817 |
| 858.90326772 | 0.82 |
| 859.07066383 | 0.797 |
| 859.23806351 | 0.788 |
| 859.40546673 | 0.773 |
| 859.57287352 | 0.768 |
| 859.74028385 | 0.742 |
| 859.90769774 | 0.738 |
| 860.07511517 | 0.719 |
| 860.24253615 | 0.714 |
| 860.40996068 | 0.701 |
| 860.57738875 | 0.689 |
| 860.74482036 | 0.668 |
| 860.91225551 | 0.66 |
| 861.0796942 | 0.643 |
| 861.24713643 | 0.633 |
| 861.41458219 | 0.615 |
| 861.58203148 | 0.609 |
| 861.7494843 | 0.595 |
| 861.91694065 | 0.578 |
| 862.08440053 | 0.563 |
| 862.25186394 | 0.549 |
| 862.41933086 | 0.533 |
| 862.58680131 | 0.523 |
| 862.75427528 | 0.506 |
| 862.92175277 | 0.498 |
| 863.08923377 | 0.48 |
| 863.25671828 | 0.475 |
| 863.42420631 | 0.459 |
| 863.59169785 | 0.456 |
| 863.7591929 | 0.43 |
| 863.92669146 | 0.427 |
| 864.09419352 | 0.409 |
| 864.26169908 | 0.399 |
| 864.42920814 | 0.388 |
| 864.59672071 | 0.376 |
| 864.76423677 | 0.364 |
| 864.93175633 | 0.358 |
| 865.09927938 | 0.338 |
| 865.26680593 | 0.324 |
| 865.43433596 | 0.321 |
| 865.60186949 | 0.306 |
| 865.7694065 | 0.293 |
| 865.936947 | 0.29 |
| 866.10449097 | 0.282 |
| 866.27203844 | 0.275 |
| 866.43958938 | 0.265 |
| 866.6071438 | 0.252 |
| 866.77470169 | 0.247 |
| 866.94226306 | 0.242 |
| 867.1098279 | 0.234 |
| 867.27739621 | 0.223 |
| 867.44496799 | 0.221 |
| 867.61254324 | 0.214 |
| 867.78012195 | 0.204 |
| 867.94770413 | 0.194 |
| 868.11528977 | 0.19 |
| 868.28287886 | 0.184 |
| 868.45047142 | 0.181 |
| 868.61806743 | 0.17 |
| 868.7856669 | 0.172 |
| 868.95326981 | 0.164 |
| 869.12087618 | 0.159 |
| 869.288486 | 0.153 |
| 869.45609926 | 0.147 |
| 869.62371597 | 0.14 |
| 869.79133612 | 0.141 |
| 869.95895972 | 0.13 |
| 870.12658675 | 0.127 |
| 870.29421722 | 0.123 |
| 870.46185113 | 0.123 |
| 870.62948847 | 0.116 |
| 870.79712924 | 0.111 |
| 870.96477344 | 0.105 |
| 871.13242108 | 0.106 |
| 871.30007214 | 0.099 |
| 871.46772662 | 0.101 |
| 871.63538453 | 0.09 |
| 871.80304586 | 0.091 |
| 871.97071061 | 0.083 |
| 872.13837877 | 0.085 |
| 872.30605036 | 0.079 |
| 872.47372535 | 0.078 |
| 872.64140376 | 0.072 |
| 872.80908558 | 0.073 |
| 872.97677081 | 0.068 |
| 873.14445944 | 0.062 |
| 873.31215148 | 0.065 |
| 873.47984693 | 0.06 |
| 873.64754577 | 0.05 |
| 873.81524802 | 0.055 |
| 873.98295366 | 0.049 |
| 874.1506627 | 0.052 |
| 874.31837513 | 0.054 |
| 874.48609095 | 0.054 |
| 874.65381017 | 0.052 |
| 874.82153277 | 0.047 |
| 874.98925876 | 0.041 |
| 875.15698814 | 0.035 |
| 875.3247209 | 0.029 |
| 875.49245704 | 0.041 |
| 875.66019656 | 0.026 |
| 875.82793945 | 0.027 |
| 875.99568573 | 0.023 |
| 876.16343537 | 0.028 |
| 876.33118839 | 0.029 |
| 876.49894478 | 0.03 |
| 876.66670454 | 0.028 |
| 876.83446767 | 0.024 |
| 877.00223416 | 0.03 |
| 877.17000401 | 0.023 |
| 877.33777723 | 0.023 |
| 877.5055538 | 0.022 |
| 877.67333374 | 0.018 |
| 877.84111702 | 0.017 |
| 878.00890367 | 0.014 |
| 878.17669366 | 0.015 |
| 878.34448701 | 0.01 |
| 878.5122837 | 0.011 |
| 878.68008374 | 0.011 |
| 878.84788713 | 0.011 |
| 879.01569386 | 0.005 |
| 879.18350393 | 0.007 |
| 879.35131734 | 0.005 |
| 879.51913408 | 0.006 |
| 879.68695417 | 0.003 |
| 879.85477758 | 0.004 |
| 880.02260433 | 0 |
| 880.19043441 | 0.004 |
| 880.35826782 | 0 |
| 880.52610456 | 0 |
| 880.69394462 | 0 |
| 880.861788 | 0 |
| 881.02963471 | 0 |
| 881.19748473 | 0 |
| 881.36533808 | 0 |
| 881.53319473 | 0 |
| 881.70105471 | 0 |
| 881.86891799 | 0 |
| 882.03678459 | 0 |
| 882.20465449 | 0 |
| 882.3725277 | 0 |
| 882.54040421 | 0 |
| 882.70828403 | 0 |
| 882.87616715 | 0 |
| 883.04405357 | 0 |
| 883.21194329 | 0 |
| 883.3798363 | 0 |
| 883.54773261 | 0 |
| 883.71563221 | 0 |
| 883.8835351 | 0 |
| 884.05144127 | 0 |
| 884.21935074 | 0 |
| 884.38726349 | 0 |
| 884.55517952 | 0 |
| 884.72309884 | 0 |
| 884.89102143 | 0 |
| 885.0589473 | 0 |
| 885.22687645 | 0 |
| 885.39480887 | 0 |
| 885.56274456 | 0 |
| 885.73068353 | 0 |
| 885.89862576 | 0 |
| 886.06657126 | 0 |
| 886.23452002 | 0 |
| 886.40247205 | 0 |
| 886.57042734 | 0 |
| 886.73838588 | 0 |
| 886.90634769 | 0 |
| 887.07431275 | 0 |
| 887.24228107 | 0 |
| 887.41025263 | 0 |
| 887.57822745 | 0 |
| 887.74620552 | 0 |
| 887.91418683 | 0 |
| 888.08217139 | 0 |
| 888.25015919 | 0 |
| 888.41815023 | 0 |
| 888.58614451 | 0 |
| 888.75414203 | 0 |
| 888.92214279 | 0 |
| 889.09014678 | 0 |
| 889.258154 | 0 |
| 889.42616445 | 0 |
| 889.59417813 | 0 |
| 889.76219504 | 0 |
| 889.93021517 | 0 |
| 890.09823852 | 0 |
| 890.2662651 | 0 |
| 890.4342949 | 0 |
| 890.60232791 | 0 |
| 890.77036414 | 0 |
| 890.93840358 | 0 |
| 891.10644624 | 0 |
| 891.2744921 | 0 |
| 891.44254118 | 0 |
| 891.61059346 | 0 |
| 891.77864894 | 0 |
| 891.94670763 | 0 |
| 892.11476952 | 0 |
| 892.28283461 | 0 |
| 892.4509029 | 0 |
| 892.61897438 | 0 |
| 892.78704905 | 0 |
| 892.95512692 | 0 |
| 893.12320798 | 0 |
| 893.29129223 | 0 |
| 893.45937966 | 0 |
| 893.62747028 | 0 |
| 893.79556409 | 0 |
| 893.96366107 | 0 |
| 894.13176123 | 0 |
| 894.29986457 | 0 |
| 894.46797109 | 0 |
| 894.63608078 | 0 |
| 894.80419364 | 0 |
| 894.97230967 | 0 |
| 895.14042887 | 0 |
| 895.30855124 | 0 |
| 895.47667677 | 0 |
| 895.64480547 | 0 |
| 895.81293732 | 0 |
| 895.98107234 | 0 |
| 896.14921051 | 0 |
| 896.31735184 | 0 |
| 896.48549633 | 0 |
| 896.65364396 | 0 |
| 896.82179475 | 0 |
| 896.98994868 | 0 |
| 897.15810576 | 0 |
| 897.32626599 | 0 |
| 897.49442935 | 0 |
| 897.66259586 | 0 |
| 897.83076551 | 0 |
| 897.9989383 | 0 |
| 898.16711422 | 0 |
| 898.33529328 | 0 |
| 898.50347547 | 0 |
| 898.67166078 | 0 |
| 898.83984923 | 0 |
| 899.0080408 | 0 |
| 899.1762355 | 0 |
| 899.34443332 | 0 |
| 899.51263427 | 0 |
| 899.68083833 | 0 |
| 899.84904551 | 0 |
| 900.0172558 | 0 |
| 900.18546921 | 0 |
| 900.35368573 | 0 |
| 900.52190536 | 0 |
| 900.6901281 | 0 |
| 900.85835395 | 0 |
| 901.0265829 | 0 |
| 901.19481495 | 0 |
| 901.36305011 | 0 |
| 901.53128836 | 0 |
| 901.69952972 | 0 |
| 901.86777416 | 0 |
| 902.0360217 | 0 |
| 902.20427234 | 0 |
| 902.37252606 | 0 |
| 902.54078287 | 0 |
| 902.70904277 | 0 |
| 902.87730576 | 0 |
| 903.04557182 | 0 |
| 903.21384097 | 0 |
| 903.3821132 | 0 |
| 903.5503885 | 0 |
| 903.71866688 | 0 |
| 903.88694834 | 0 |
| 904.05523286 | 0 |
| 904.22352046 | 0 |
| 904.39181112 | 0 |
| 904.56010485 | 0 |
| 904.72840165 | 0 |
| 904.89670151 | 0 |
| 905.06500443 | 0 |
| 905.23331041 | 0 |
| 905.40161944 | 0 |
| 905.56993154 | 0 |
| 905.73824668 | 0 |
| 905.90656488 | 0 |
| 906.07488613 | 0 |
| 906.24321043 | 0 |
| 906.41153777 | 0 |
| 906.57986816 | 0 |
| 906.74820159 | 0 |
| 906.91653806 | 0 |
| 907.08487757 | 0 |
| 907.25322012 | 0 |
| 907.4215657 | 0 |
| 907.58991432 | 0 |
| 907.75826597 | 0 |
| 907.92662065 | 0 |
| 908.09497836 | 0 |
| 908.2633391 | 0 |
| 908.43170286 | 0 |
| 908.60006964 | 0 |
| 908.76843944 | 0 |
| 908.93681227 | 0 |
| 909.10518811 | 0 |
| 909.27356696 | 0 |
| 909.44194883 | 0 |
| 909.61033371 | 0 |
| 909.77872161 | 0 |
| 909.94711251 | 0 |
| 910.11550641 | 0 |
| 910.28390333 | 0 |
| 910.45230324 | 0 |
| 910.62070616 | 0 |
| 910.78911207 | 0 |
| 910.95752098 | 0 |
| 911.12593289 | 0 |
| 911.29434779 | 0 |
| 911.46276569 | 0 |
| 911.63118657 | 0 |
| 911.79961044 | 0 |
| 911.9680373 | 0 |
| 912.13646714 | 0 |
| 912.30489997 | 0 |
| 912.47333578 | 0 |
| 912.64177456 | 0 |
| 912.81021633 | 0 |
| 912.97866107 | 0 |
| 913.14710878 | 0 |
| 913.31555946 | 0 |
| 913.48401312 | 0 |
| 913.65246974 | 0 |
| 913.82092933 | 0 |
| 913.98939189 | 0 |
| 914.1578574 | 0 |
| 914.32632588 | 0 |
| 914.49479732 | 0 |
| 914.66327172 | 0 |
| 914.83174907 | 0 |
| 915.00022937 | 0 |
| 915.16871263 | 0 |
| 915.33719883 | 0 |
| 915.50568799 | 0 |
| 915.67418009 | 0 |
| 915.84267513 | 0 |
| 916.01117312 | 0 |
| 916.17967405 | 0 |
| 916.34817792 | 0 |
| 916.51668473 | 0 |
| 916.68519447 | 0 |
| 916.85370714 | 0 |
| 917.02222275 | 0 |
| 917.19074129 | 0 |
| 917.35926275 | 0 |
| 917.52778715 | 0 |
| 917.69631446 | 0 |
| 917.8648447 | 0 |
| 918.03337786 | 0 |
| 918.20191394 | 0 |
| 918.37045294 | 0 |
| 918.53899485 | 0 |
| 918.70753968 | 0 |
| 918.87608742 | 0 |
| 919.04463807 | 0 |
| 919.21319162 | 0 |
| 919.38174808 | 0 |
| 919.55030745 | 0 |
| 919.71886972 | 0 |
| 919.88743489 | 0 |
| 920.05600296 | 0 |
| 920.22457393 | 0 |
| 920.39314779 | 0 |
| 920.56172455 | 0 |
| 920.7303042 | 0 |
| 920.89888674 | 0 |
| 921.06747217 | 0 |
| 921.23606048 | 0 |
| 921.40465168 | 0 |
| 921.57324576 | 0 |
| 921.74184272 | 0 |
| 921.91044256 | 0 |
| 922.07904528 | 0 |
| 922.24765087 | 0 |
| 922.41625934 | 0 |
| 922.58487068 | 0 |
| 922.75348489 | 0 |
| 922.92210197 | 0 |
| 923.09072191 | 0 |
| 923.25934472 | 0 |
| 923.42797039 | 0 |
| 923.59659892 | 0 |
| 923.76523031 | 0 |
| 923.93386456 | 0 |
| 924.10250167 | 0 |
| 924.27114162 | 0 |
| 924.43978443 | 0 |
| 924.60843009 | 0 |
| 924.7770786 | 0 |
| 924.94572996 | 0 |
| 925.11438415 | 0 |
| 925.2830412 | 0 |
| 925.45170108 | 0 |
| 925.6203638 | 0 |
| 925.78902936 | 0 |
| 925.95769775 | 0 |
| 926.12636898 | 0 |
| 926.29504304 | 0 |
| 926.46371993 | 0 |
| 926.63239965 | 0 |
| 926.80108219 | 0 |
| 926.96976756 | 0 |
| 927.13845575 | 0 |
| 927.30714676 | 0 |
| 927.47584059 | 0 |
| 927.64453724 | 0 |
| 927.81323671 | 0 |
| 927.98193899 | 0 |
| 928.15064407 | 0 |
| 928.31935197 | 0 |
| 928.48806268 | 0 |
| 928.6567762 | 0 |
| 928.82549251 | 0 |
| 928.99421164 | 0 |
| 929.16293356 | 0 |
| 929.33165828 | 0 |
| 929.5003858 | 0 |
| 929.66911611 | 0 |
| 929.83784922 | 0 |
| 930.00658512 | 0 |
| 930.17532381 | 0 |
| 930.34406528 | 0 |
| 930.51280955 | 0 |
| 930.6815566 | 0 |
| 930.85030643 | 0 |
| 931.01905904 | 0 |
| 931.18781443 | 0 |
| 931.3565726 | 0 |
| 931.52533354 | 0 |
| 931.69409726 | 0 |
| 931.86286375 | 0 |
| 932.031633 | 0 |
| 932.20040503 | 0 |
| 932.36917982 | 0 |
| 932.53795738 | 0 |
| 932.7067377 | 0 |
| 932.87552078 | 0 |
| 933.04430662 | 0 |
| 933.21309522 | 0 |
| 933.38188657 | 0 |
| 933.55068068 | 0 |
| 933.71947754 | 0 |
| 933.88827715 | 0 |
| 934.0570795 | 0 |
| 934.2258846 | 0 |
| 934.39469245 | 0 |
| 934.56350304 | 0 |
| 934.73231637 | 0 |
| 934.90113244 | 0 |
| 935.06995125 | 0 |
| 935.23877279 | 0 |
| 935.40759706 | 0 |
| 935.57642407 | 0 |
| 935.74525381 | 0 |
| 935.91408627 | 0 |
| 936.08292146 | 0 |
| 936.25175938 | 0 |
| 936.42060002 | 0 |
| 936.58944338 | 0 |
| 936.75828946 | 0 |
| 936.92713825 | 0 |
| 937.09598976 | 0 |
| 937.26484399 | 0 |
| 937.43370092 | 0 |
| 937.60256057 | 0 |
| 937.77142292 | 0 |
| 937.94028798 | 0 |
| 938.10915575 | 0 |
| 938.27802621 | 0 |
| 938.44689938 | 0 |
| 938.61577525 | 0 |
| 938.78465381 | 0 |
| 938.95353507 | 0 |
| 939.12241903 | 0 |
| 939.29130567 | 0 |
| 939.46019501 | 0 |
| 939.62908703 | 0 |
| 939.79798174 | 0 |
| 939.96687913 | 0 |
| 940.13577921 | 0 |
| 940.30468196 | 0 |
| 940.4735874 | 0 |
| 940.64249551 | 0 |
| 940.8114063 | 0 |
| 940.98031976 | 0 |
| 941.1492359 | 0 |
| 941.3181547 | 0 |
| 941.48707617 | 0 |
| 941.65600031 | 0 |
| 941.82492711 | 0 |
| 941.99385657 | 0 |
| 942.1627887 | 0 |
| 942.33172348 | 0 |
| 942.50066092 | 0 |
| 942.66960102 | 0 |
| 942.83854377 | 0 |
| 943.00748917 | 0 |
| 943.17643722 | 0 |
| 943.34538792 | 0 |
| 943.51434127 | 0 |
| 943.68329726 | 0 |
| 943.85225589 | 0 |
| 944.02121716 | 0 |
| 944.19018108 | 0 |
| 944.35914763 | 0 |
| 944.52811681 | 0 |
| 944.69708863 | 0 |
| 944.86606308 | 0 |
| 945.03504016 | 0 |
| 945.20401987 | 0 |
| 945.3730022 | 0 |
| 945.54198716 | 0 |
| 945.71097474 | 0 |
| 945.87996494 | 0 |
| 946.04895776 | 0 |
| 946.2179532 | 0 |
| 946.38695125 | 0 |
| 946.55595192 | 0 |
| 946.72495519 | 0 |
| 946.89396108 | 0 |
| 947.06296958 | 0 |
| 947.23198068 | 0 |
| 947.40099439 | 0 |
| 947.57001069 | 0 |
| 947.7390296 | 0 |
| 947.90805111 | 0 |
| 948.07707522 | 0 |
| 948.24610192 | 0 |
| 948.41513121 | 0 |
| 948.5841631 | 0 |
| 948.75319757 | 0 |
| 948.92223464 | 0 |
| 949.09127429 | 0 |
| 949.26031652 | 0 |
| 949.42936134 | 0 |
| 949.59840873 | 0 |
| 949.76745871 | 0 |
| 949.93651126 | 0 |
| 950.10556639 | 0 |
| 950.27462409 | 0 |
| 950.44368436 | 0 |
| 950.61274721 | 0 |
| 950.78181262 | 0 |
| 950.95088059 | 0 |
| 951.11995114 | 0 |
| 951.28902424 | 0 |
| 951.4580999 | 0 |
| 951.62717813 | 0 |
| 951.79625891 | 0 |
| 951.96534224 | 0 |
| 952.13442813 | 0 |
| 952.30351657 | 0 |
| 952.47260756 | 0 |
| 952.6417011 | 0 |
| 952.81079718 | 0 |
| 952.97989581 | 0 |
| 953.14899698 | 0 |
| 953.3181007 | 0 |
| 953.48720695 | 0 |
| 953.65631573 | 0 |
| 953.82542706 | 0 |
| 953.99454091 | 0 |
| 954.1636573 | 0 |
| 954.33277622 | 0 |
| 954.50189766 | 0 |
| 954.67102163 | 0 |
| 954.84014813 | 0 |
| 955.00927715 | 0 |
| 955.17840869 | 0 |
| 955.34754274 | 0 |
| 955.51667932 | 0 |
| 955.68581841 | 0 |
| 955.85496001 | 0 |
| 956.02410413 | 0 |
| 956.19325075 | 0 |
| 956.36239988 | 0 |
| 956.53155152 | 0 |
| 956.70070566 | 0 |
| 956.86986231 | 0 |
| 957.03902146 | 0 |
| 957.2081831 | 0 |
| 957.37734724 | 0 |
| 957.54651388 | 0 |
| 957.71568301 | 0 |
| 957.88485463 | 0 |
| 958.05402874 | 0 |
| 958.22320534 | 0 |
| 958.39238442 | 0 |
| 958.56156599 | 0 |
| 958.73075005 | 0 |
| 958.89993658 | 0 |
| 959.06912559 | 0 |
| 959.23831708 | 0 |
| 959.40751104 | 0 |
| 959.57670748 | 0 |
| 959.74590638 | 0 |
| 959.91510776 | 0 |
| 960.08431161 | 0 |
| 960.25351792 | 0 |
| 960.4227267 | 0 |
| 960.59193793 | 0 |
| 960.76115163 | 0 |
| 960.93036779 | 0 |
| 961.09958641 | 0 |
| 961.26880747 | 0 |
| 961.438031 | 0 |
| 961.60725697 | 0 |
| 961.7764854 | 0 |
| 961.94571627 | 0 |
| 962.11494959 | 0 |
| 962.28418535 | 0 |
| 962.45342355 | 0 |
| 962.6226642 | 0 |
| 962.79190728 | 0 |
| 962.9611528 | 0 |
| 963.13040076 | 0 |
| 963.29965115 | 0 |
| 963.46890397 | 0 |
| 963.63815922 | 0 |
| 963.8074169 | 0 |
| 963.976677 | 0 |
| 964.14593953 | 0 |
| 964.31520448 | 0 |
| 964.48447185 | 0 |
| 964.65374164 | 0 |
| 964.82301385 | 0 |
| 964.99228847 | 0 |
| 965.16156551 | 0 |
| 965.33084495 | 0 |
| 965.50012681 | 0 |
| 965.66941107 | 0 |
| 965.83869774 | 0 |
| 966.00798682 | 0 |
| 966.17727829 | 0 |
| 966.34657217 | 0 |
| 966.51586845 | 0 |
| 966.68516712 | 0 |
| 966.85446819 | 0 |
| 967.02377165 | 0 |
| 967.1930775 | 0 |
| 967.36238574 | 0 |
| 967.53169637 | 0 |
| 967.70100939 | 0 |
| 967.87032479 | 0 |
| 968.03964257 | 0 |
| 968.20896274 | 0 |
| 968.37828528 | 0 |
| 968.5476102 | 0 |
| 968.71693749 | 0 |
| 968.88626716 | 0 |
| 969.05559919 | 0 |
| 969.2249336 | 0 |
| 969.39427038 | 0 |
| 969.56360952 | 0 |
| 969.73295103 | 0 |
| 969.90229489 | 0 |
| 970.07164112 | 0 |
| 970.24098971 | 0 |
| 970.41034065 | 0 |
| 970.57969395 | 0 |
| 970.7490496 | 0 |
| 970.91840761 | 0 |
| 971.08776796 | 0 |
| 971.25713066 | 0 |
| 971.42649571 | 0 |
| 971.5958631 | 0 |
| 971.76523283 | 0 |
| 971.93460491 | 0 |
| 972.10397932 | 0 |
| 972.27335607 | 0 |
| 972.44273515 | 0 |
| 972.61211657 | 0 |
| 972.78150032 | 0 |
| 972.9508864 | 0 |
| 973.1202748 | 0 |
| 973.28966554 | 0 |
| 973.45905859 | 0 |
| 973.62845397 | 0 |
| 973.79785167 | 0 |
| 973.96725169 | 0 |
| 974.13665402 | 0 |
| 974.30605867 | 0 |
| 974.47546563 | 0 |
| 974.64487491 | 0 |
| 974.81428649 | 0 |
| 974.98370038 | 0 |
| 975.15311658 | 0 |
| 975.32253508 | 0 |
| 975.49195589 | 0 |
| 975.66137899 | 0 |
| 975.83080439 | 0 |
| 976.00023209 | 0 |
| 976.16966209 | 0 |
| 976.33909437 | 0 |
| 976.50852895 | 0 |
| 976.67796582 | 0 |
| 976.84740498 | 0 |
| 977.01684642 | 0 |
| 977.18629014 | 0 |
| 977.35573615 | 0 |
| 977.52518444 | 0 |
| 977.69463501 | 0 |
| 977.86408785 | 0 |
| 978.03354297 | 0 |
| 978.20300036 | 0 |
| 978.37246003 | 0 |
| 978.54192196 | 0 |
| 978.71138616 | 0 |
| 978.88085263 | 0 |
| 979.05032136 | 0 |
| 979.21979235 | 0 |
| 979.3892656 | 0 |
| 979.55874112 | 0 |
| 979.72821888 | 0 |
| 979.89769891 | 0 |
| 980.06718119 | 0 |
| 980.23666571 | 0 |
| 980.40615249 | 0 |
| 980.57564152 | 0 |
| 980.74513279 | 0 |
| 980.9146263 | 0 |
| 981.08412206 | 0 |
| 981.25362006 | 0 |
| 981.42312029 | 0 |
| 981.59262277 | 0 |
| 981.76212747 | 0 |
| 981.93163441 | 0 |
| 982.10114359 | 0 |
| 982.27065499 | 0 |
| 982.44016862 | 0 |
| 982.60968447 | 0 |
| 982.77920255 | 0 |
| 982.94872285 | 0 |
| 983.11824538 | 0 |
| 983.28777012 | 0 |
| 983.45729707 | 0 |
| 983.62682625 | 0 |
| 983.79635763 | 0 |
| 983.96589123 | 0 |
| 984.13542703 | 0 |
| 984.30496505 | 0 |
| 984.47450527 | 0 |
| 984.64404769 | 0 |
| 984.81359231 | 0 |
| 984.98313914 | 0 |
| 985.15268817 | 0 |
| 985.32223939 | 0 |
| 985.4917928 | 0 |
| 985.66134841 | 0 |
| 985.83090621 | 0 |
| 986.0004662 | 0 |
| 986.17002838 | 0 |
| 986.33959274 | 0 |
| 986.50915929 | 0 |
| 986.67872802 | 0 |
| 986.84829893 | 0 |
| 987.01787202 | 0 |
| 987.18744728 | 0 |
| 987.35702472 | 0 |
| 987.52660433 | 0 |
| 987.69618612 | 0 |
| 987.86577007 | 0 |
| 988.03535619 | 0 |
| 988.20494448 | 0 |
| 988.37453493 | 0 |
| 988.54412754 | 0 |
| 988.71372232 | 0 |
| 988.88331925 | 0 |
| 989.05291834 | 0 |
| 989.22251958 | 0 |
| 989.39212298 | 0 |
| 989.56172852 | 0 |
| 989.73133622 | 0 |
| 989.90094606 | 0 |
| 990.07055805 | 0 |
| 990.24017219 | 0 |
| 990.40978847 | 0 |
| 990.57940688 | 0 |
| 990.74902744 | 0 |
| 990.91865013 | 0 |
| 991.08827496 | 0 |
| 991.25790192 | 0 |
| 991.42753101 | 0 |
| 991.59716223 | 0 |
| 991.76679557 | 0 |
| 991.93643105 | 0 |
| 992.10606865 | 0 |
| 992.27570837 | 0 |
| 992.4453502 | 0 |
| 992.61499416 | 0 |
| 992.78464024 | 0 |
| 992.95428843 | 0 |
| 993.12393873 | 0 |
| 993.29359114 | 0 |
| 993.46324567 | 0 |
| 993.6329023 | 0 |
| 993.80256104 | 0 |
| 993.97222188 | 0 |
| 994.14188482 | 0 |
| 994.31154986 | 0 |
| 994.481217 | 0 |
| 994.65088624 | 0 |
| 994.82055757 | 0 |
| 994.990231 | 0 |
| 995.15990652 | 0 |
| 995.32958412 | 0 |
| 995.49926382 | 0 |
| 995.6689456 | 0 |
| 995.83862946 | 0 |
| 996.00831541 | 0 |
| 996.17800343 | 0 |
| 996.34769354 | 0 |
| 996.51738572 | 0 |
| 996.68707997 | 0 |
| 996.8567763 | 0 |
| 997.0264747 | 0 |
| 997.19617517 | 0 |
| 997.36587771 | 0 |
| 997.53558231 | 0 |
| 997.70528897 | 0 |
| 997.8749977 | 0 |
| 998.04470849 | 0 |
| 998.21442134 | 0 |
| 998.38413624 | 0 |
| 998.5538532 | 0 |
| 998.72357221 | 0 |
| 998.89329327 | 0 |
| 999.06301638 | 0 |
| 999.23274154 | 0 |
| 999.40246875 | 0 |
| 999.572198 | 0 |
| 999.74192929 | 0 |
| 999.91166262 | 0 |
| 1000.08139799 | 0 |
| 1000.25113539 | 0 |
| 1000.42087483 | 0 |
| 1000.59061631 | 0 |
| 1000.76035981 | 0 |
| 1000.93010535 | 0 |
| 1001.09985291 | 0 |
| 1001.26960249 | 0 |
| 1001.43935411 | 0 |
| 1001.60910774 | 0 |
| 1001.77886339 | 0 |
| 1001.94862106 | 0 |
| 1002.11838075 | 0 |
| 1002.28814245 | 0 |
| 1002.45790617 | 0 |
| 1002.6276719 | 0 |
| 1002.79743963 | 0 |
| 1002.96720938 | 0 |
| 1003.13698112 | 0 |
| 1003.30675488 | 0 |
| 1003.47653063 | 0 |
| 1003.64630839 | 0 |
| 1003.81608814 | 0 |
| 1003.98586989 | 0 |
| 1004.15565364 | 0 |
| 1004.32543937 | 0 |
| 1004.4952271 | 0 |
| 1004.66501682 | 0 |
| 1004.83480853 | 0 |
| 1005.00460222 | 0 |
| 1005.17439789 | 0 |
| 1005.34419555 | 0 |
| 1005.51399519 | 0 |
| 1005.6837968 | 0 |
| 1005.85360039 | 0 |
| 1006.02340596 | 0 |
| 1006.1932135 | 0 |
| 1006.36302301 | 0 |
| 1006.53283449 | 0 |
| 1006.70264794 | 0 |
| 1006.87246335 | 0 |
| 1007.04228073 | 0 |
| 1007.21210007 | 0 |
| 1007.38192136 | 0 |
| 1007.55174462 | 0 |
| 1007.72156983 | 0 |
| 1007.891397 | 0 |
| 1008.06122612 | 0 |
| 1008.2310572 | 0 |
| 1008.40089022 | 0 |
| 1008.57072519 | 0 |
| 1008.7405621 | 0 |
| 1008.91040096 | 0 |
| 1009.08024176 | 0 |
| 1009.2500845 | 0 |
| 1009.41992918 | 0 |
| 1009.58977579 | 0 |
| 1009.75962434 | 0 |
| 1009.92947482 | 0 |
| 1010.09932724 | 0 |
| 1010.26918158 | 0 |
| 1010.43903785 | 0 |
| 1010.60889605 | 0 |
| 1010.77875617 | 0 |
| 1010.94861821 | 0 |
| 1011.11848217 | 0 |
| 1011.28834805 | 0 |
| 1011.45821585 | 0 |
| 1011.62808556 | 0 |
| 1011.79795718 | 0 |
| 1011.96783071 | 0 |
| 1012.13770616 | 0 |
| 1012.30758351 | 0 |
| 1012.47746277 | 0 |
| 1012.64734393 | 0 |
| 1012.81722699 | 0 |
| 1012.98711195 | 0 |
| 1013.15699881 | 0 |
| 1013.32688757 | 0 |
| 1013.49677822 | 0 |
| 1013.66667077 | 0 |
| 1013.8365652 | 0 |
| 1014.00646153 | 0 |
| 1014.17635974 | 0 |
| 1014.34625984 | 0 |
| 1014.51616182 | 0 |
| 1014.68606568 | 0 |
| 1014.85597143 | 0 |
| 1015.02587905 | 0 |
| 1015.19578855 | 0 |
| 1015.36569992 | 0 |
| 1015.53561317 | 0 |
| 1015.70552828 | 0 |
| 1015.87544527 | 0 |
| 1016.04536412 | 0 |
| 1016.21528484 | 0 |
| 1016.38520742 | 0 |
| 1016.55513187 | 0 |
| 1016.72505817 | 0 |
| 1016.89498633 | 0 |
| 1017.06491635 | 0 |
| 1017.23484823 | 0 |
| 1017.40478195 | 0 |
| 1017.57471753 | 0 |
| 1017.74465495 | 0 |
| 1017.91459423 | 0 |
| 1018.08453535 | 0 |
| 1018.25447831 | 0 |
| 1018.42442312 | 0 |
| 1018.59436976 | 0 |
| 1018.76431824 | 0 |
| 1018.93426856 | 0 |
| 1019.10422072 | 0 |
| 1019.2741747 | 0 |
| 1019.44413052 | 0 |
| 1019.61408817 | 0 |
| 1019.78404764 | 0 |
| 1019.95400894 | 0 |
| 1020.12397206 | 0 |
| 1020.29393701 | 0 |
| 1020.46390377 | 0 |
| 1020.63387236 | 0 |
| 1020.80384276 | 0 |
| 1020.97381497 | 0 |
| 1021.143789 | 0 |
| 1021.31376484 | 0 |
| 1021.48374248 | 0 |
| 1021.65372194 | 0 |
| 1021.8237032 | 0 |
| 1021.99368626 | 0 |
| 1022.16367113 | 0 |
| 1022.33365779 | 0 |
| 1022.50364625 | 0 |
| 1022.67363651 | 0 |
| 1022.84362857 | 0 |
| 1023.01362242 | 0 |
| 1023.18361805 | 0 |
| 1023.35361548 | 0 |
| 1023.5236147 | 0 |
| 1023.6936157 | 0 |
| 1023.86361848 | 0 |
| 1024.03362304 | 0 |
| 1024.20362939 | 0 |
| 1024.37363751 | 0 |
| 1024.54364741 | 0 |
| 1024.71365909 | 0 |
| 1024.88367253 | 0 |
| 1025.05368775 | 0 |
| 1025.22370474 | 0 |
| 1025.39372349 | 0 |
| 1025.56374401 | 0 |
| 1025.73376629 | 0 |
| 1025.90379034 | 0 |
| 1026.07381614 | 0 |
| 1026.24384371 | 0 |
| 1026.41387303 | 0 |
| 1026.5839041 | 0 |
| 1026.75393693 | 0 |
| 1026.9239715 | 0 |
| 1027.09400783 | 0 |
| 1027.26404591 | 0 |
| 1027.43408572 | 0 |
| 1027.60412729 | 0 |
| 1027.77417059 | 0 |
| 1027.94421564 | 0 |
| 1028.11426242 | 0 |
| 1028.28431094 | 0 |
| 1028.45436119 | 0 |
| 1028.62441318 | 0 |
| 1028.79446689 | 0 |
| 1028.96452234 | 0 |
| 1029.13457951 | 0 |
| 1029.30463841 | 0 |
| 1029.47469903 | 0 |
| 1029.64476138 | 0 |
| 1029.81482544 | 0 |
| 1029.98489122 | 0 |
| 1030.15495872 | 0 |
| 1030.32502793 | 0 |
| 1030.49509886 | 0 |
| 1030.6651715 | 0 |
| 1030.83524584 | 0 |
| 1031.00532189 | 0 |
| 1031.17539965 | 0 |
| 1031.34547911 | 0 |
| 1031.51556028 | 0 |
| 1031.68564314 | 0 |
| 1031.8557277 | 0 |
| 1032.02581396 | 0 |
| 1032.19590191 | 0 |
| 1032.36599155 | 0 |
| 1032.53608289 | 0 |
| 1032.70617591 | 0 |
| 1032.87627062 | 0 |
| 1033.04636702 | 0 |
| 1033.2164651 | 0 |
| 1033.38656486 | 0 |
| 1033.55666631 | 0 |
| 1033.72676943 | 0 |
| 1033.89687422 | 0 |
| 1034.06698069 | 0 |
| 1034.23708884 | 0 |
| 1034.40719865 | 0 |
| 1034.57731013 | 0 |
| 1034.74742328 | 0 |
| 1034.9175381 | 0 |
| 1035.08765458 | 0 |
| 1035.25777272 | 0 |
| 1035.42789252 | 0 |
| 1035.59801398 | 0 |
| 1035.76813709 | 0 |
| 1035.93826186 | 0 |
| 1036.10838829 | 0 |
| 1036.27851636 | 0 |
| 1036.44864608 | 0 |
| 1036.61877745 | 0 |
| 1036.78891046 | 0 |
| 1036.95904512 | 0 |
| 1037.12918142 | 0 |
| 1037.29931936 | 0 |
| 1037.46945894 | 0 |
| 1037.63960015 | 0 |
| 1037.809743 | 0 |
| 1037.97988748 | 0 |
| 1038.15003359 | 0 |
| 1038.32018133 | 0 |
| 1038.4903307 | 0 |
| 1038.66048169 | 0 |
| 1038.83063431 | 0 |
| 1039.00078855 | 0 |
| 1039.17094441 | 0 |
| 1039.34110188 | 0 |
| 1039.51126097 | 0 |
| 1039.68142168 | 0 |
| 1039.851584 | 0 |
| 1040.02174793 | 0 |
| 1040.19191347 | 0 |
| 1040.36208061 | 0 |
| 1040.53224936 | 0 |
| 1040.70241972 | 0 |
| 1040.87259167 | 0 |
| 1041.04276523 | 0 |
| 1041.21294038 | 0 |
| 1041.38311713 | 0 |
| 1041.55329548 | 0 |
| 1041.72347542 | 0 |
| 1041.89365694 | 0 |
| 1042.06384006 | 0 |
| 1042.23402476 | 0 |
| 1042.40421105 | 0 |
| 1042.57439893 | 0 |
| 1042.74458838 | 0 |
| 1042.91477941 | 0 |
| 1043.08497203 | 0 |
| 1043.25516621 | 0 |
| 1043.42536198 | 0 |
| 1043.59555931 | 0 |
| 1043.76575822 | 0 |
| 1043.93595869 | 0 |
| 1044.10616073 | 0 |
| 1044.27636434 | 0 |
| 1044.44656951 | 0 |
| 1044.61677624 | 0 |
| 1044.78698454 | 0 |
| 1044.95719438 | 0 |
| 1045.12740579 | 0 |
| 1045.29761875 | 0 |
| 1045.46783326 | 0 |
| 1045.63804933 | 0 |
| 1045.80826694 | 0 |
| 1045.9784861 | 0 |
| 1046.1487068 | 0 |
| 1046.31892905 | 0 |
| 1046.48915284 | 0 |
| 1046.65937817 | 0 |
| 1046.82960504 | 0 |
| 1046.99983344 | 0 |
| 1047.17006338 | 0 |
| 1047.34029485 | 0 |
| 1047.51052785 | 0 |
| 1047.68076238 | 0 |
| 1047.85099844 | 0 |
| 1048.02123602 | 0 |
| 1048.19147513 | 0 |
| 1048.36171575 | 0 |
| 1048.5319579 | 0 |
| 1048.70220156 | 0 |
| 1048.87244675 | 0 |
| 1049.04269344 | 0 |
| 1049.21294165 | 0 |
| 1049.38319137 | 0 |
| 1049.55344259 | 0 |
| 1049.72369533 | 0 |
| 1049.89394957 | 0 |
| 1050.06420531 | 0 |
| 1050.23446255 | 0 |
| 1050.4047213 | 0 |
| 1050.57498154 | 0 |
| 1050.74524328 | 0 |
| 1050.91550651 | 0 |
| 1051.08577124 | 0 |
| 1051.25603745 | 0 |
| 1051.42630516 | 0 |
| 1051.59657435 | 0 |
| 1051.76684502 | 0 |
| 1051.93711718 | 0 |
| 1052.10739083 | 0 |
| 1052.27766595 | 0 |
| 1052.44794255 | 0 |
| 1052.61822062 | 0 |
| 1052.78850017 | 0 |
| 1052.95878119 | 0 |
| 1053.12906369 | 0 |
| 1053.29934765 | 0 |
| 1053.46963307 | 0 |
| 1053.63991997 | 0 |
| 1053.81020832 | 0 |
| 1053.98049814 | 0 |
| 1054.15078942 | 0 |
| 1054.32108216 | 0 |
| 1054.49137635 | 0 |
| 1054.661672 | 0 |
| 1054.83196909 | 0 |
| 1055.00226764 | 0 |
| 1055.17256764 | 0 |
| 1055.34286909 | 0 |
| 1055.51317198 | 0 |
| 1055.68347631 | 0 |
| 1055.85378209 | 0 |
| 1056.0240893 | 0 |
| 1056.19439795 | 0 |
| 1056.36470804 | 0 |
| 1056.53501956 | 0 |
| 1056.70533252 | 0 |
| 1056.8756469 | 0 |
| 1057.04596272 | 0 |
| 1057.21627996 | 0 |
| 1057.38659863 | 0 |
| 1057.55691872 | 0 |
| 1057.72724023 | 0 |
| 1057.89756316 | 0 |
| 1058.06788751 | 0 |
| 1058.23821327 | 0 |
| 1058.40854045 | 0 |
| 1058.57886905 | 0 |
| 1058.74919905 | 0 |
| 1058.91953046 | 0 |
| 1059.08986328 | 0 |
| 1059.2601975 | 0 |
| 1059.43053313 | 0 |
| 1059.60087015 | 0 |
| 1059.77120858 | 0 |
| 1059.94154841 | 0 |
| 1060.11188963 | 0 |
| 1060.28223224 | 0 |
| 1060.45257625 | 0 |
| 1060.62292165 | 0 |
| 1060.79326844 | 0 |
| 1060.96361661 | 0 |
| 1061.13396617 | 0 |
| 1061.30431711 | 0 |
| 1061.47466944 | 0 |
| 1061.64502314 | 0 |
| 1061.81537822 | 0 |
| 1061.98573468 | 0 |
| 1062.15609251 | 0 |
| 1062.32645171 | 0 |
| 1062.49681229 | 0 |
| 1062.66717423 | 0 |
| 1062.83753754 | 0 |
| 1063.00790222 | 0 |
| 1063.17826826 | 0 |
| 1063.34863565 | 0 |
| 1063.51900441 | 0 |
| 1063.68937453 | 0 |
| 1063.859746 | 0 |
| 1064.03011883 | 0 |
| 1064.20049301 | 0 |
| 1064.37086854 | 0 |
| 1064.54124542 | 0 |
| 1064.71162365 | 0 |
| 1064.88200322 | 0 |
| 1065.05238413 | 0 |
| 1065.22276639 | 0 |
| 1065.39314998 | 0 |
| 1065.56353492 | 0 |
| 1065.73392118 | 0 |
| 1065.90430879 | 0 |
| 1066.07469772 | 0 |
| 1066.24508799 | 0 |
| 1066.41547958 | 0 |
| 1066.5858725 | 0 |
| 1066.75626675 | 0 |
| 1066.92666232 | 0 |
| 1067.09705921 | 0 |
| 1067.26745742 | 0 |
| 1067.43785695 | 0 |
| 1067.60825779 | 0 |
| 1067.77865995 | 0 |
| 1067.94906342 | 0 |
| 1068.11946821 | 0 |
| 1068.2898743 | 0 |
| 1068.46028169 | 0 |
| 1068.63069039 | 0 |
| 1068.8011004 | 0 |
| 1068.97151171 | 0 |
| 1069.14192431 | 0 |
| 1069.31233821 | 0 |
| 1069.48275341 | 0 |
| 1069.65316991 | 0 |
| 1069.82358769 | 0 |
| 1069.99400677 | 0 |
| 1070.16442714 | 0 |
| 1070.33484879 | 0 |
| 1070.50527172 | 0 |
| 1070.67569594 | 0 |
| 1070.84612145 | 0 |
| 1071.01654823 | 0 |
| 1071.18697629 | 0 |
| 1071.35740562 | 0 |
| 1071.52783623 | 0 |
| 1071.69826811 | 0 |
| 1071.86870126 | 0 |
| 1072.03913568 | 0 |
| 1072.20957137 | 0 |
| 1072.38000832 | 0 |
| 1072.55044654 | 0 |
| 1072.72088601 | 0 |
| 1072.89132675 | 0 |
| 1073.06176874 | 0 |
| 1073.23221199 | 0 |
| 1073.4026565 | 0 |
| 1073.57310225 | 0 |
| 1073.74354926 | 0 |
| 1073.91399751 | 0 |
| 1074.08444702 | 0 |
| 1074.25489776 | 0 |
| 1074.42534975 | 0 |
| 1074.59580298 | 0 |
| 1074.76625745 | 0 |
| 1074.93671316 | 0 |
| 1075.10717011 | 0 |
| 1075.27762828 | 0 |
| 1075.4480877 | 0 |
| 1075.61854834 | 0 |
| 1075.78901021 | 0 |
| 1075.9594733 | 0 |
| 1076.12993762 | 0 |
| 1076.30040317 | 0 |
| 1076.47086993 | 0 |
| 1076.64133792 | 0 |
| 1076.81180712 | 0 |
| 1076.98227754 | 0 |
| 1077.15274917 | 0 |
| 1077.32322202 | 0 |
| 1077.49369607 | 0 |
| 1077.66417134 | 0 |
| 1077.83464781 | 0 |
| 1078.00512548 | 0 |
| 1078.17560436 | 0 |
| 1078.34608444 | 0 |
| 1078.51656572 | 0 |
| 1078.6870482 | 0 |
| 1078.85753187 | 0 |
| 1079.02801674 | 0 |
| 1079.1985028 | 0 |
| 1079.36899005 | 0 |
| 1079.53947849 | 0 |
| 1079.70996811 | 0 |
| 1079.88045892 | 0 |
| 1080.05095092 | 0 |
| 1080.22144409 | 0 |
| 1080.39193844 | 0 |
| 1080.56243398 | 0 |
| 1080.73293068 | 0 |
| 1080.90342856 | 0 |
| 1081.07392762 | 0 |
| 1081.24442784 | 0 |
| 1081.41492923 | 0 |
| 1081.58543179 | 0 |
| 1081.75593552 | 0 |
| 1081.9264404 | 0 |
| 1082.09694645 | 0 |
| 1082.26745366 | 0 |
| 1082.43796203 | 0 |
| 1082.60847155 | 0 |
| 1082.77898222 | 0 |
| 1082.94949405 | 0 |
| 1083.12000703 | 0 |
| 1083.29052115 | 0 |
| 1083.46103643 | 0 |
| 1083.63155284 | 0 |
| 1083.8020704 | 0 |
| 1083.97258911 | 0 |
| 1084.14310895 | 0 |
| 1084.31362993 | 0 |
| 1084.48415204 | 0 |
| 1084.65467529 | 0 |
| 1084.82519967 | 0 |
| 1084.99572518 | 0 |
| 1085.16625182 | 0 |
| 1085.33677959 | 0 |
| 1085.50730848 | 0 |
| 1085.6778385 | 0 |
| 1085.84836963 | 0 |
| 1086.01890189 | 0 |
| 1086.18943526 | 0 |
| 1086.35996975 | 0 |
| 1086.53050535 | 0 |
| 1086.70104206 | 0 |
| 1086.87157989 | 0 |
| 1087.04211882 | 0 |
| 1087.21265886 | 0 |
| 1087.38320001 | 0 |
| 1087.55374226 | 0 |
| 1087.7242856 | 0 |
| 1087.89483005 | 0 |
| 1088.0653756 | 0 |
| 1088.23592224 | 0 |
| 1088.40646998 | 0 |
| 1088.5770188 | 0 |
| 1088.74756872 | 0 |
| 1088.91811973 | 0 |
| 1089.08867182 | 0 |
| 1089.259225 | 0 |
| 1089.42977926 | 0 |
| 1089.6003346 | 0 |
| 1089.77089103 | 0 |
| 1089.94144853 | 0 |
| 1090.1120071 | 0 |
| 1090.28256675 | 0 |
| 1090.45312747 | 0 |
| 1090.62368926 | 0 |
| 1090.79425212 | 0 |
| 1090.96481605 | 0 |
| 1091.13538104 | 0 |
| 1091.30594709 | 0 |
| 1091.47651421 | 0 |
| 1091.64708238 | 0 |
| 1091.81765161 | 0 |
| 1091.9882219 | 0 |
| 1092.15879324 | 0 |
| 1092.32936564 | 0 |
| 1092.49993908 | 0 |
| 1092.67051358 | 0 |
| 1092.84108911 | 0 |
| 1093.0116657 | 0 |
| 1093.18224333 | 0 |
| 1093.35282199 | 0 |
| 1093.5234017 | 0 |
| 1093.69398245 | 0 |
| 1093.86456423 | 0 |
| 1094.03514704 | 0 |
| 1094.20573089 | 0 |
| 1094.37631576 | 0 |
| 1094.54690167 | 0 |
| 1094.7174886 | 0 |
| 1094.88807656 | 0 |
| 1095.05866554 | 0 |
| 1095.22925554 | 0 |
| 1095.39984656 | 0 |
| 1095.5704386 | 0 |
| 1095.74103165 | 0 |
| 1095.91162572 | 0 |
| 1096.0822208 | 0 |
| 1096.25281689 | 0 |
| 1096.42341398 | 0 |
| 1096.59401209 | 0 |
| 1096.7646112 | 0 |
| 1096.93521131 | 0 |
| 1097.10581242 | 0 |
| 1097.27641453 | 0 |
| 1097.44701764 | 0 |
| 1097.61762175 | 0 |
| 1097.78822685 | 0 |
| 1097.95883294 | 0 |